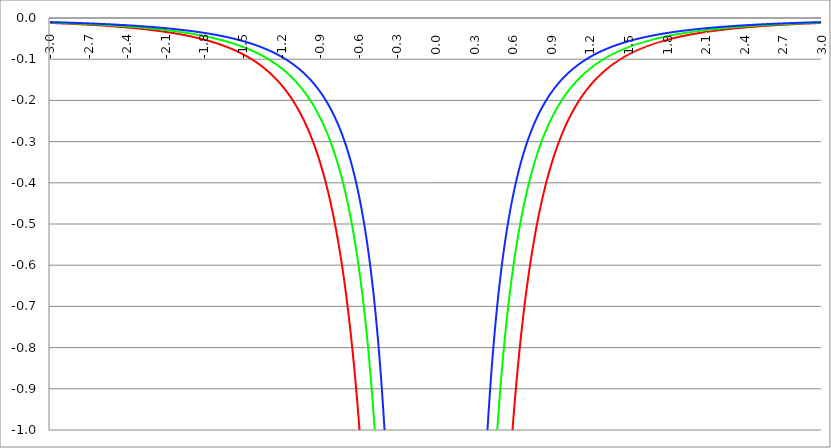
| Category | Series 1 | Series 0 | Series 2 |
|---|---|---|---|
| -3.0 | -0.012 | -0.011 | -0.01 |
| -2.997 | -0.012 | -0.011 | -0.01 |
| -2.994 | -0.012 | -0.011 | -0.01 |
| -2.991 | -0.012 | -0.011 | -0.01 |
| -2.988 | -0.012 | -0.011 | -0.01 |
| -2.984999999999999 | -0.012 | -0.011 | -0.01 |
| -2.981999999999999 | -0.012 | -0.011 | -0.01 |
| -2.978999999999999 | -0.012 | -0.011 | -0.01 |
| -2.975999999999999 | -0.012 | -0.011 | -0.01 |
| -2.972999999999999 | -0.012 | -0.011 | -0.01 |
| -2.969999999999999 | -0.012 | -0.011 | -0.01 |
| -2.966999999999999 | -0.012 | -0.011 | -0.01 |
| -2.963999999999999 | -0.012 | -0.011 | -0.01 |
| -2.960999999999998 | -0.012 | -0.011 | -0.01 |
| -2.957999999999998 | -0.012 | -0.011 | -0.01 |
| -2.954999999999998 | -0.012 | -0.011 | -0.01 |
| -2.951999999999998 | -0.013 | -0.012 | -0.01 |
| -2.948999999999998 | -0.013 | -0.012 | -0.01 |
| -2.945999999999998 | -0.013 | -0.012 | -0.01 |
| -2.942999999999998 | -0.013 | -0.012 | -0.01 |
| -2.939999999999998 | -0.013 | -0.012 | -0.01 |
| -2.936999999999998 | -0.013 | -0.012 | -0.01 |
| -2.933999999999997 | -0.013 | -0.012 | -0.01 |
| -2.930999999999997 | -0.013 | -0.012 | -0.01 |
| -2.927999999999997 | -0.013 | -0.012 | -0.011 |
| -2.924999999999997 | -0.013 | -0.012 | -0.011 |
| -2.921999999999997 | -0.013 | -0.012 | -0.011 |
| -2.918999999999997 | -0.013 | -0.012 | -0.011 |
| -2.915999999999997 | -0.013 | -0.012 | -0.011 |
| -2.912999999999997 | -0.013 | -0.012 | -0.011 |
| -2.909999999999997 | -0.013 | -0.012 | -0.011 |
| -2.906999999999996 | -0.013 | -0.012 | -0.011 |
| -2.903999999999996 | -0.013 | -0.012 | -0.011 |
| -2.900999999999996 | -0.013 | -0.012 | -0.011 |
| -2.897999999999996 | -0.013 | -0.012 | -0.011 |
| -2.894999999999996 | -0.013 | -0.012 | -0.011 |
| -2.891999999999996 | -0.013 | -0.012 | -0.011 |
| -2.888999999999996 | -0.013 | -0.012 | -0.011 |
| -2.885999999999996 | -0.013 | -0.012 | -0.011 |
| -2.882999999999996 | -0.013 | -0.012 | -0.011 |
| -2.879999999999995 | -0.013 | -0.012 | -0.011 |
| -2.876999999999995 | -0.014 | -0.012 | -0.011 |
| -2.873999999999995 | -0.014 | -0.012 | -0.011 |
| -2.870999999999995 | -0.014 | -0.012 | -0.011 |
| -2.867999999999995 | -0.014 | -0.012 | -0.011 |
| -2.864999999999995 | -0.014 | -0.013 | -0.011 |
| -2.861999999999995 | -0.014 | -0.013 | -0.011 |
| -2.858999999999995 | -0.014 | -0.013 | -0.011 |
| -2.855999999999994 | -0.014 | -0.013 | -0.011 |
| -2.852999999999994 | -0.014 | -0.013 | -0.011 |
| -2.849999999999994 | -0.014 | -0.013 | -0.011 |
| -2.846999999999994 | -0.014 | -0.013 | -0.011 |
| -2.843999999999994 | -0.014 | -0.013 | -0.011 |
| -2.840999999999994 | -0.014 | -0.013 | -0.011 |
| -2.837999999999994 | -0.014 | -0.013 | -0.011 |
| -2.834999999999994 | -0.014 | -0.013 | -0.011 |
| -2.831999999999994 | -0.014 | -0.013 | -0.011 |
| -2.828999999999993 | -0.014 | -0.013 | -0.012 |
| -2.825999999999993 | -0.014 | -0.013 | -0.012 |
| -2.822999999999993 | -0.014 | -0.013 | -0.012 |
| -2.819999999999993 | -0.014 | -0.013 | -0.012 |
| -2.816999999999993 | -0.014 | -0.013 | -0.012 |
| -2.813999999999993 | -0.014 | -0.013 | -0.012 |
| -2.810999999999993 | -0.014 | -0.013 | -0.012 |
| -2.807999999999993 | -0.015 | -0.013 | -0.012 |
| -2.804999999999993 | -0.015 | -0.013 | -0.012 |
| -2.801999999999992 | -0.015 | -0.013 | -0.012 |
| -2.798999999999992 | -0.015 | -0.013 | -0.012 |
| -2.795999999999992 | -0.015 | -0.013 | -0.012 |
| -2.792999999999992 | -0.015 | -0.013 | -0.012 |
| -2.789999999999992 | -0.015 | -0.013 | -0.012 |
| -2.786999999999992 | -0.015 | -0.014 | -0.012 |
| -2.783999999999992 | -0.015 | -0.014 | -0.012 |
| -2.780999999999992 | -0.015 | -0.014 | -0.012 |
| -2.777999999999992 | -0.015 | -0.014 | -0.012 |
| -2.774999999999991 | -0.015 | -0.014 | -0.012 |
| -2.771999999999991 | -0.015 | -0.014 | -0.012 |
| -2.768999999999991 | -0.015 | -0.014 | -0.012 |
| -2.765999999999991 | -0.015 | -0.014 | -0.012 |
| -2.762999999999991 | -0.015 | -0.014 | -0.012 |
| -2.759999999999991 | -0.015 | -0.014 | -0.012 |
| -2.756999999999991 | -0.015 | -0.014 | -0.012 |
| -2.753999999999991 | -0.015 | -0.014 | -0.012 |
| -2.75099999999999 | -0.015 | -0.014 | -0.012 |
| -2.74799999999999 | -0.015 | -0.014 | -0.012 |
| -2.74499999999999 | -0.016 | -0.014 | -0.012 |
| -2.74199999999999 | -0.016 | -0.014 | -0.013 |
| -2.73899999999999 | -0.016 | -0.014 | -0.013 |
| -2.73599999999999 | -0.016 | -0.014 | -0.013 |
| -2.73299999999999 | -0.016 | -0.014 | -0.013 |
| -2.72999999999999 | -0.016 | -0.014 | -0.013 |
| -2.72699999999999 | -0.016 | -0.014 | -0.013 |
| -2.723999999999989 | -0.016 | -0.014 | -0.013 |
| -2.720999999999989 | -0.016 | -0.014 | -0.013 |
| -2.717999999999989 | -0.016 | -0.014 | -0.013 |
| -2.714999999999989 | -0.016 | -0.015 | -0.013 |
| -2.711999999999989 | -0.016 | -0.015 | -0.013 |
| -2.708999999999989 | -0.016 | -0.015 | -0.013 |
| -2.705999999999989 | -0.016 | -0.015 | -0.013 |
| -2.702999999999989 | -0.016 | -0.015 | -0.013 |
| -2.699999999999989 | -0.016 | -0.015 | -0.013 |
| -2.696999999999988 | -0.016 | -0.015 | -0.013 |
| -2.693999999999988 | -0.016 | -0.015 | -0.013 |
| -2.690999999999988 | -0.016 | -0.015 | -0.013 |
| -2.687999999999988 | -0.016 | -0.015 | -0.013 |
| -2.684999999999988 | -0.017 | -0.015 | -0.013 |
| -2.681999999999988 | -0.017 | -0.015 | -0.013 |
| -2.678999999999988 | -0.017 | -0.015 | -0.013 |
| -2.675999999999988 | -0.017 | -0.015 | -0.013 |
| -2.672999999999988 | -0.017 | -0.015 | -0.013 |
| -2.669999999999987 | -0.017 | -0.015 | -0.013 |
| -2.666999999999987 | -0.017 | -0.015 | -0.013 |
| -2.663999999999987 | -0.017 | -0.015 | -0.013 |
| -2.660999999999987 | -0.017 | -0.015 | -0.014 |
| -2.657999999999987 | -0.017 | -0.015 | -0.014 |
| -2.654999999999987 | -0.017 | -0.015 | -0.014 |
| -2.651999999999987 | -0.017 | -0.016 | -0.014 |
| -2.648999999999987 | -0.017 | -0.016 | -0.014 |
| -2.645999999999986 | -0.017 | -0.016 | -0.014 |
| -2.642999999999986 | -0.017 | -0.016 | -0.014 |
| -2.639999999999986 | -0.017 | -0.016 | -0.014 |
| -2.636999999999986 | -0.017 | -0.016 | -0.014 |
| -2.633999999999986 | -0.018 | -0.016 | -0.014 |
| -2.630999999999986 | -0.018 | -0.016 | -0.014 |
| -2.627999999999986 | -0.018 | -0.016 | -0.014 |
| -2.624999999999986 | -0.018 | -0.016 | -0.014 |
| -2.621999999999986 | -0.018 | -0.016 | -0.014 |
| -2.618999999999985 | -0.018 | -0.016 | -0.014 |
| -2.615999999999985 | -0.018 | -0.016 | -0.014 |
| -2.612999999999985 | -0.018 | -0.016 | -0.014 |
| -2.609999999999985 | -0.018 | -0.016 | -0.014 |
| -2.606999999999985 | -0.018 | -0.016 | -0.014 |
| -2.603999999999985 | -0.018 | -0.016 | -0.014 |
| -2.600999999999985 | -0.018 | -0.016 | -0.014 |
| -2.597999999999985 | -0.018 | -0.016 | -0.014 |
| -2.594999999999985 | -0.018 | -0.016 | -0.014 |
| -2.591999999999985 | -0.018 | -0.017 | -0.014 |
| -2.588999999999984 | -0.018 | -0.017 | -0.015 |
| -2.585999999999984 | -0.018 | -0.017 | -0.015 |
| -2.582999999999984 | -0.019 | -0.017 | -0.015 |
| -2.579999999999984 | -0.019 | -0.017 | -0.015 |
| -2.576999999999984 | -0.019 | -0.017 | -0.015 |
| -2.573999999999984 | -0.019 | -0.017 | -0.015 |
| -2.570999999999984 | -0.019 | -0.017 | -0.015 |
| -2.567999999999984 | -0.019 | -0.017 | -0.015 |
| -2.564999999999984 | -0.019 | -0.017 | -0.015 |
| -2.561999999999983 | -0.019 | -0.017 | -0.015 |
| -2.558999999999983 | -0.019 | -0.017 | -0.015 |
| -2.555999999999983 | -0.019 | -0.017 | -0.015 |
| -2.552999999999983 | -0.019 | -0.017 | -0.015 |
| -2.549999999999983 | -0.019 | -0.017 | -0.015 |
| -2.546999999999983 | -0.019 | -0.017 | -0.015 |
| -2.543999999999983 | -0.019 | -0.017 | -0.015 |
| -2.540999999999983 | -0.019 | -0.017 | -0.015 |
| -2.537999999999982 | -0.02 | -0.018 | -0.015 |
| -2.534999999999982 | -0.02 | -0.018 | -0.015 |
| -2.531999999999982 | -0.02 | -0.018 | -0.015 |
| -2.528999999999982 | -0.02 | -0.018 | -0.015 |
| -2.525999999999982 | -0.02 | -0.018 | -0.015 |
| -2.522999999999982 | -0.02 | -0.018 | -0.016 |
| -2.519999999999982 | -0.02 | -0.018 | -0.016 |
| -2.516999999999982 | -0.02 | -0.018 | -0.016 |
| -2.513999999999982 | -0.02 | -0.018 | -0.016 |
| -2.510999999999981 | -0.02 | -0.018 | -0.016 |
| -2.507999999999981 | -0.02 | -0.018 | -0.016 |
| -2.504999999999981 | -0.02 | -0.018 | -0.016 |
| -2.501999999999981 | -0.02 | -0.018 | -0.016 |
| -2.498999999999981 | -0.02 | -0.018 | -0.016 |
| -2.495999999999981 | -0.02 | -0.018 | -0.016 |
| -2.492999999999981 | -0.021 | -0.018 | -0.016 |
| -2.489999999999981 | -0.021 | -0.018 | -0.016 |
| -2.486999999999981 | -0.021 | -0.019 | -0.016 |
| -2.48399999999998 | -0.021 | -0.019 | -0.016 |
| -2.48099999999998 | -0.021 | -0.019 | -0.016 |
| -2.47799999999998 | -0.021 | -0.019 | -0.016 |
| -2.47499999999998 | -0.021 | -0.019 | -0.016 |
| -2.47199999999998 | -0.021 | -0.019 | -0.016 |
| -2.46899999999998 | -0.021 | -0.019 | -0.016 |
| -2.46599999999998 | -0.021 | -0.019 | -0.016 |
| -2.46299999999998 | -0.021 | -0.019 | -0.017 |
| -2.45999999999998 | -0.021 | -0.019 | -0.017 |
| -2.456999999999979 | -0.021 | -0.019 | -0.017 |
| -2.453999999999979 | -0.022 | -0.019 | -0.017 |
| -2.450999999999979 | -0.022 | -0.019 | -0.017 |
| -2.44799999999998 | -0.022 | -0.019 | -0.017 |
| -2.444999999999979 | -0.022 | -0.019 | -0.017 |
| -2.441999999999979 | -0.022 | -0.019 | -0.017 |
| -2.438999999999979 | -0.022 | -0.02 | -0.017 |
| -2.435999999999979 | -0.022 | -0.02 | -0.017 |
| -2.432999999999978 | -0.022 | -0.02 | -0.017 |
| -2.429999999999978 | -0.022 | -0.02 | -0.017 |
| -2.426999999999978 | -0.022 | -0.02 | -0.017 |
| -2.423999999999978 | -0.022 | -0.02 | -0.017 |
| -2.420999999999978 | -0.022 | -0.02 | -0.017 |
| -2.417999999999978 | -0.022 | -0.02 | -0.017 |
| -2.414999999999978 | -0.023 | -0.02 | -0.017 |
| -2.411999999999978 | -0.023 | -0.02 | -0.017 |
| -2.408999999999978 | -0.023 | -0.02 | -0.017 |
| -2.405999999999977 | -0.023 | -0.02 | -0.018 |
| -2.402999999999977 | -0.023 | -0.02 | -0.018 |
| -2.399999999999977 | -0.023 | -0.02 | -0.018 |
| -2.396999999999977 | -0.023 | -0.02 | -0.018 |
| -2.393999999999977 | -0.023 | -0.021 | -0.018 |
| -2.390999999999977 | -0.023 | -0.021 | -0.018 |
| -2.387999999999977 | -0.023 | -0.021 | -0.018 |
| -2.384999999999977 | -0.023 | -0.021 | -0.018 |
| -2.381999999999977 | -0.023 | -0.021 | -0.018 |
| -2.378999999999976 | -0.024 | -0.021 | -0.018 |
| -2.375999999999976 | -0.024 | -0.021 | -0.018 |
| -2.372999999999976 | -0.024 | -0.021 | -0.018 |
| -2.369999999999976 | -0.024 | -0.021 | -0.018 |
| -2.366999999999976 | -0.024 | -0.021 | -0.018 |
| -2.363999999999976 | -0.024 | -0.021 | -0.018 |
| -2.360999999999976 | -0.024 | -0.021 | -0.018 |
| -2.357999999999976 | -0.024 | -0.021 | -0.018 |
| -2.354999999999976 | -0.024 | -0.021 | -0.019 |
| -2.351999999999975 | -0.024 | -0.022 | -0.019 |
| -2.348999999999975 | -0.024 | -0.022 | -0.019 |
| -2.345999999999975 | -0.025 | -0.022 | -0.019 |
| -2.342999999999975 | -0.025 | -0.022 | -0.019 |
| -2.339999999999975 | -0.025 | -0.022 | -0.019 |
| -2.336999999999975 | -0.025 | -0.022 | -0.019 |
| -2.333999999999975 | -0.025 | -0.022 | -0.019 |
| -2.330999999999975 | -0.025 | -0.022 | -0.019 |
| -2.327999999999974 | -0.025 | -0.022 | -0.019 |
| -2.324999999999974 | -0.025 | -0.022 | -0.019 |
| -2.321999999999974 | -0.025 | -0.022 | -0.019 |
| -2.318999999999974 | -0.025 | -0.022 | -0.019 |
| -2.315999999999974 | -0.025 | -0.022 | -0.019 |
| -2.312999999999974 | -0.026 | -0.023 | -0.019 |
| -2.309999999999974 | -0.026 | -0.023 | -0.019 |
| -2.306999999999974 | -0.026 | -0.023 | -0.02 |
| -2.303999999999974 | -0.026 | -0.023 | -0.02 |
| -2.300999999999973 | -0.026 | -0.023 | -0.02 |
| -2.297999999999973 | -0.026 | -0.023 | -0.02 |
| -2.294999999999973 | -0.026 | -0.023 | -0.02 |
| -2.291999999999973 | -0.026 | -0.023 | -0.02 |
| -2.288999999999973 | -0.026 | -0.023 | -0.02 |
| -2.285999999999973 | -0.026 | -0.023 | -0.02 |
| -2.282999999999973 | -0.027 | -0.023 | -0.02 |
| -2.279999999999973 | -0.027 | -0.023 | -0.02 |
| -2.276999999999973 | -0.027 | -0.024 | -0.02 |
| -2.273999999999972 | -0.027 | -0.024 | -0.02 |
| -2.270999999999972 | -0.027 | -0.024 | -0.02 |
| -2.267999999999972 | -0.027 | -0.024 | -0.02 |
| -2.264999999999972 | -0.027 | -0.024 | -0.02 |
| -2.261999999999972 | -0.027 | -0.024 | -0.021 |
| -2.258999999999972 | -0.027 | -0.024 | -0.021 |
| -2.255999999999972 | -0.027 | -0.024 | -0.021 |
| -2.252999999999972 | -0.028 | -0.024 | -0.021 |
| -2.249999999999972 | -0.028 | -0.024 | -0.021 |
| -2.246999999999971 | -0.028 | -0.024 | -0.021 |
| -2.243999999999971 | -0.028 | -0.024 | -0.021 |
| -2.240999999999971 | -0.028 | -0.025 | -0.021 |
| -2.237999999999971 | -0.028 | -0.025 | -0.021 |
| -2.234999999999971 | -0.028 | -0.025 | -0.021 |
| -2.231999999999971 | -0.028 | -0.025 | -0.021 |
| -2.228999999999971 | -0.028 | -0.025 | -0.021 |
| -2.225999999999971 | -0.029 | -0.025 | -0.021 |
| -2.222999999999971 | -0.029 | -0.025 | -0.021 |
| -2.21999999999997 | -0.029 | -0.025 | -0.022 |
| -2.21699999999997 | -0.029 | -0.025 | -0.022 |
| -2.21399999999997 | -0.029 | -0.025 | -0.022 |
| -2.21099999999997 | -0.029 | -0.025 | -0.022 |
| -2.20799999999997 | -0.029 | -0.026 | -0.022 |
| -2.20499999999997 | -0.029 | -0.026 | -0.022 |
| -2.20199999999997 | -0.029 | -0.026 | -0.022 |
| -2.19899999999997 | -0.03 | -0.026 | -0.022 |
| -2.19599999999997 | -0.03 | -0.026 | -0.022 |
| -2.192999999999969 | -0.03 | -0.026 | -0.022 |
| -2.189999999999969 | -0.03 | -0.026 | -0.022 |
| -2.186999999999969 | -0.03 | -0.026 | -0.022 |
| -2.18399999999997 | -0.03 | -0.026 | -0.022 |
| -2.180999999999969 | -0.03 | -0.026 | -0.023 |
| -2.177999999999969 | -0.03 | -0.027 | -0.023 |
| -2.174999999999969 | -0.031 | -0.027 | -0.023 |
| -2.171999999999969 | -0.031 | -0.027 | -0.023 |
| -2.168999999999968 | -0.031 | -0.027 | -0.023 |
| -2.165999999999968 | -0.031 | -0.027 | -0.023 |
| -2.162999999999968 | -0.031 | -0.027 | -0.023 |
| -2.159999999999968 | -0.031 | -0.027 | -0.023 |
| -2.156999999999968 | -0.031 | -0.027 | -0.023 |
| -2.153999999999968 | -0.031 | -0.027 | -0.023 |
| -2.150999999999968 | -0.032 | -0.027 | -0.023 |
| -2.147999999999968 | -0.032 | -0.028 | -0.023 |
| -2.144999999999968 | -0.032 | -0.028 | -0.023 |
| -2.141999999999967 | -0.032 | -0.028 | -0.024 |
| -2.138999999999967 | -0.032 | -0.028 | -0.024 |
| -2.135999999999967 | -0.032 | -0.028 | -0.024 |
| -2.132999999999967 | -0.032 | -0.028 | -0.024 |
| -2.129999999999967 | -0.032 | -0.028 | -0.024 |
| -2.126999999999967 | -0.033 | -0.028 | -0.024 |
| -2.123999999999967 | -0.033 | -0.028 | -0.024 |
| -2.120999999999967 | -0.033 | -0.028 | -0.024 |
| -2.117999999999967 | -0.033 | -0.029 | -0.024 |
| -2.114999999999966 | -0.033 | -0.029 | -0.024 |
| -2.111999999999966 | -0.033 | -0.029 | -0.024 |
| -2.108999999999966 | -0.033 | -0.029 | -0.024 |
| -2.105999999999966 | -0.034 | -0.029 | -0.025 |
| -2.102999999999966 | -0.034 | -0.029 | -0.025 |
| -2.099999999999966 | -0.034 | -0.029 | -0.025 |
| -2.096999999999966 | -0.034 | -0.029 | -0.025 |
| -2.093999999999966 | -0.034 | -0.029 | -0.025 |
| -2.090999999999966 | -0.034 | -0.03 | -0.025 |
| -2.087999999999965 | -0.034 | -0.03 | -0.025 |
| -2.084999999999965 | -0.035 | -0.03 | -0.025 |
| -2.081999999999965 | -0.035 | -0.03 | -0.025 |
| -2.078999999999965 | -0.035 | -0.03 | -0.025 |
| -2.075999999999965 | -0.035 | -0.03 | -0.025 |
| -2.072999999999965 | -0.035 | -0.03 | -0.026 |
| -2.069999999999965 | -0.035 | -0.03 | -0.026 |
| -2.066999999999965 | -0.035 | -0.031 | -0.026 |
| -2.063999999999965 | -0.036 | -0.031 | -0.026 |
| -2.060999999999964 | -0.036 | -0.031 | -0.026 |
| -2.057999999999964 | -0.036 | -0.031 | -0.026 |
| -2.054999999999964 | -0.036 | -0.031 | -0.026 |
| -2.051999999999964 | -0.036 | -0.031 | -0.026 |
| -2.048999999999964 | -0.036 | -0.031 | -0.026 |
| -2.045999999999964 | -0.036 | -0.031 | -0.026 |
| -2.042999999999964 | -0.037 | -0.031 | -0.027 |
| -2.039999999999964 | -0.037 | -0.032 | -0.027 |
| -2.036999999999963 | -0.037 | -0.032 | -0.027 |
| -2.033999999999963 | -0.037 | -0.032 | -0.027 |
| -2.030999999999963 | -0.037 | -0.032 | -0.027 |
| -2.027999999999963 | -0.037 | -0.032 | -0.027 |
| -2.024999999999963 | -0.038 | -0.032 | -0.027 |
| -2.021999999999963 | -0.038 | -0.032 | -0.027 |
| -2.018999999999963 | -0.038 | -0.032 | -0.027 |
| -2.015999999999963 | -0.038 | -0.033 | -0.027 |
| -2.012999999999963 | -0.038 | -0.033 | -0.028 |
| -2.009999999999962 | -0.038 | -0.033 | -0.028 |
| -2.006999999999962 | -0.039 | -0.033 | -0.028 |
| -2.003999999999962 | -0.039 | -0.033 | -0.028 |
| -2.000999999999962 | -0.039 | -0.033 | -0.028 |
| -1.997999999999962 | -0.039 | -0.033 | -0.028 |
| -1.994999999999962 | -0.039 | -0.034 | -0.028 |
| -1.991999999999962 | -0.039 | -0.034 | -0.028 |
| -1.988999999999963 | -0.04 | -0.034 | -0.028 |
| -1.985999999999963 | -0.04 | -0.034 | -0.028 |
| -1.982999999999963 | -0.04 | -0.034 | -0.029 |
| -1.979999999999963 | -0.04 | -0.034 | -0.029 |
| -1.976999999999963 | -0.04 | -0.034 | -0.029 |
| -1.973999999999963 | -0.04 | -0.034 | -0.029 |
| -1.970999999999963 | -0.041 | -0.035 | -0.029 |
| -1.967999999999963 | -0.041 | -0.035 | -0.029 |
| -1.964999999999963 | -0.041 | -0.035 | -0.029 |
| -1.961999999999964 | -0.041 | -0.035 | -0.029 |
| -1.958999999999964 | -0.041 | -0.035 | -0.029 |
| -1.955999999999964 | -0.041 | -0.035 | -0.03 |
| -1.952999999999964 | -0.042 | -0.035 | -0.03 |
| -1.949999999999964 | -0.042 | -0.036 | -0.03 |
| -1.946999999999964 | -0.042 | -0.036 | -0.03 |
| -1.943999999999964 | -0.042 | -0.036 | -0.03 |
| -1.940999999999964 | -0.042 | -0.036 | -0.03 |
| -1.937999999999964 | -0.043 | -0.036 | -0.03 |
| -1.934999999999964 | -0.043 | -0.036 | -0.03 |
| -1.931999999999965 | -0.043 | -0.036 | -0.03 |
| -1.928999999999965 | -0.043 | -0.037 | -0.031 |
| -1.925999999999965 | -0.043 | -0.037 | -0.031 |
| -1.922999999999965 | -0.044 | -0.037 | -0.031 |
| -1.919999999999965 | -0.044 | -0.037 | -0.031 |
| -1.916999999999965 | -0.044 | -0.037 | -0.031 |
| -1.913999999999965 | -0.044 | -0.037 | -0.031 |
| -1.910999999999965 | -0.044 | -0.038 | -0.031 |
| -1.907999999999965 | -0.045 | -0.038 | -0.031 |
| -1.904999999999966 | -0.045 | -0.038 | -0.032 |
| -1.901999999999966 | -0.045 | -0.038 | -0.032 |
| -1.898999999999966 | -0.045 | -0.038 | -0.032 |
| -1.895999999999966 | -0.045 | -0.038 | -0.032 |
| -1.892999999999966 | -0.046 | -0.039 | -0.032 |
| -1.889999999999966 | -0.046 | -0.039 | -0.032 |
| -1.886999999999966 | -0.046 | -0.039 | -0.032 |
| -1.883999999999966 | -0.046 | -0.039 | -0.032 |
| -1.880999999999966 | -0.046 | -0.039 | -0.033 |
| -1.877999999999967 | -0.047 | -0.039 | -0.033 |
| -1.874999999999967 | -0.047 | -0.039 | -0.033 |
| -1.871999999999967 | -0.047 | -0.04 | -0.033 |
| -1.868999999999967 | -0.047 | -0.04 | -0.033 |
| -1.865999999999967 | -0.047 | -0.04 | -0.033 |
| -1.862999999999967 | -0.048 | -0.04 | -0.033 |
| -1.859999999999967 | -0.048 | -0.04 | -0.033 |
| -1.856999999999967 | -0.048 | -0.041 | -0.034 |
| -1.853999999999967 | -0.048 | -0.041 | -0.034 |
| -1.850999999999968 | -0.049 | -0.041 | -0.034 |
| -1.847999999999968 | -0.049 | -0.041 | -0.034 |
| -1.844999999999968 | -0.049 | -0.041 | -0.034 |
| -1.841999999999968 | -0.049 | -0.041 | -0.034 |
| -1.838999999999968 | -0.049 | -0.042 | -0.034 |
| -1.835999999999968 | -0.05 | -0.042 | -0.035 |
| -1.832999999999968 | -0.05 | -0.042 | -0.035 |
| -1.829999999999968 | -0.05 | -0.042 | -0.035 |
| -1.826999999999968 | -0.05 | -0.042 | -0.035 |
| -1.823999999999968 | -0.051 | -0.042 | -0.035 |
| -1.820999999999969 | -0.051 | -0.043 | -0.035 |
| -1.817999999999969 | -0.051 | -0.043 | -0.035 |
| -1.814999999999969 | -0.051 | -0.043 | -0.035 |
| -1.811999999999969 | -0.052 | -0.043 | -0.036 |
| -1.808999999999969 | -0.052 | -0.043 | -0.036 |
| -1.805999999999969 | -0.052 | -0.044 | -0.036 |
| -1.802999999999969 | -0.052 | -0.044 | -0.036 |
| -1.799999999999969 | -0.053 | -0.044 | -0.036 |
| -1.796999999999969 | -0.053 | -0.044 | -0.036 |
| -1.79399999999997 | -0.053 | -0.044 | -0.037 |
| -1.79099999999997 | -0.053 | -0.045 | -0.037 |
| -1.78799999999997 | -0.054 | -0.045 | -0.037 |
| -1.78499999999997 | -0.054 | -0.045 | -0.037 |
| -1.78199999999997 | -0.054 | -0.045 | -0.037 |
| -1.77899999999997 | -0.054 | -0.045 | -0.037 |
| -1.77599999999997 | -0.055 | -0.046 | -0.037 |
| -1.77299999999997 | -0.055 | -0.046 | -0.038 |
| -1.76999999999997 | -0.055 | -0.046 | -0.038 |
| -1.766999999999971 | -0.055 | -0.046 | -0.038 |
| -1.763999999999971 | -0.056 | -0.046 | -0.038 |
| -1.760999999999971 | -0.056 | -0.047 | -0.038 |
| -1.757999999999971 | -0.056 | -0.047 | -0.038 |
| -1.754999999999971 | -0.057 | -0.047 | -0.039 |
| -1.751999999999971 | -0.057 | -0.047 | -0.039 |
| -1.748999999999971 | -0.057 | -0.047 | -0.039 |
| -1.745999999999971 | -0.057 | -0.048 | -0.039 |
| -1.742999999999971 | -0.058 | -0.048 | -0.039 |
| -1.739999999999971 | -0.058 | -0.048 | -0.039 |
| -1.736999999999972 | -0.058 | -0.048 | -0.039 |
| -1.733999999999972 | -0.058 | -0.048 | -0.04 |
| -1.730999999999972 | -0.059 | -0.049 | -0.04 |
| -1.727999999999972 | -0.059 | -0.049 | -0.04 |
| -1.724999999999972 | -0.059 | -0.049 | -0.04 |
| -1.721999999999972 | -0.06 | -0.049 | -0.04 |
| -1.718999999999972 | -0.06 | -0.05 | -0.04 |
| -1.715999999999972 | -0.06 | -0.05 | -0.041 |
| -1.712999999999972 | -0.061 | -0.05 | -0.041 |
| -1.709999999999973 | -0.061 | -0.05 | -0.041 |
| -1.706999999999973 | -0.061 | -0.05 | -0.041 |
| -1.703999999999973 | -0.061 | -0.051 | -0.041 |
| -1.700999999999973 | -0.062 | -0.051 | -0.042 |
| -1.697999999999973 | -0.062 | -0.051 | -0.042 |
| -1.694999999999973 | -0.062 | -0.051 | -0.042 |
| -1.691999999999973 | -0.063 | -0.052 | -0.042 |
| -1.688999999999973 | -0.063 | -0.052 | -0.042 |
| -1.685999999999973 | -0.063 | -0.052 | -0.042 |
| -1.682999999999974 | -0.064 | -0.052 | -0.043 |
| -1.679999999999974 | -0.064 | -0.053 | -0.043 |
| -1.676999999999974 | -0.064 | -0.053 | -0.043 |
| -1.673999999999974 | -0.065 | -0.053 | -0.043 |
| -1.670999999999974 | -0.065 | -0.053 | -0.043 |
| -1.667999999999974 | -0.065 | -0.054 | -0.044 |
| -1.664999999999974 | -0.066 | -0.054 | -0.044 |
| -1.661999999999974 | -0.066 | -0.054 | -0.044 |
| -1.658999999999974 | -0.066 | -0.054 | -0.044 |
| -1.655999999999975 | -0.067 | -0.055 | -0.044 |
| -1.652999999999975 | -0.067 | -0.055 | -0.045 |
| -1.649999999999975 | -0.067 | -0.055 | -0.045 |
| -1.646999999999975 | -0.068 | -0.055 | -0.045 |
| -1.643999999999975 | -0.068 | -0.056 | -0.045 |
| -1.640999999999975 | -0.068 | -0.056 | -0.045 |
| -1.637999999999975 | -0.069 | -0.056 | -0.045 |
| -1.634999999999975 | -0.069 | -0.056 | -0.046 |
| -1.631999999999975 | -0.069 | -0.057 | -0.046 |
| -1.628999999999975 | -0.07 | -0.057 | -0.046 |
| -1.625999999999976 | -0.07 | -0.057 | -0.046 |
| -1.622999999999976 | -0.071 | -0.057 | -0.046 |
| -1.619999999999976 | -0.071 | -0.058 | -0.047 |
| -1.616999999999976 | -0.071 | -0.058 | -0.047 |
| -1.613999999999976 | -0.072 | -0.058 | -0.047 |
| -1.610999999999976 | -0.072 | -0.059 | -0.047 |
| -1.607999999999976 | -0.072 | -0.059 | -0.048 |
| -1.604999999999976 | -0.073 | -0.059 | -0.048 |
| -1.601999999999976 | -0.073 | -0.059 | -0.048 |
| -1.598999999999977 | -0.074 | -0.06 | -0.048 |
| -1.595999999999977 | -0.074 | -0.06 | -0.048 |
| -1.592999999999977 | -0.074 | -0.06 | -0.049 |
| -1.589999999999977 | -0.075 | -0.061 | -0.049 |
| -1.586999999999977 | -0.075 | -0.061 | -0.049 |
| -1.583999999999977 | -0.076 | -0.061 | -0.049 |
| -1.580999999999977 | -0.076 | -0.061 | -0.05 |
| -1.577999999999977 | -0.076 | -0.062 | -0.05 |
| -1.574999999999978 | -0.077 | -0.062 | -0.05 |
| -1.571999999999978 | -0.077 | -0.062 | -0.05 |
| -1.568999999999978 | -0.078 | -0.063 | -0.05 |
| -1.565999999999978 | -0.078 | -0.063 | -0.051 |
| -1.562999999999978 | -0.078 | -0.063 | -0.051 |
| -1.559999999999978 | -0.079 | -0.064 | -0.051 |
| -1.556999999999978 | -0.079 | -0.064 | -0.051 |
| -1.553999999999978 | -0.08 | -0.064 | -0.052 |
| -1.550999999999978 | -0.08 | -0.065 | -0.052 |
| -1.547999999999978 | -0.081 | -0.065 | -0.052 |
| -1.544999999999979 | -0.081 | -0.065 | -0.052 |
| -1.541999999999979 | -0.081 | -0.065 | -0.053 |
| -1.538999999999979 | -0.082 | -0.066 | -0.053 |
| -1.535999999999979 | -0.082 | -0.066 | -0.053 |
| -1.532999999999979 | -0.083 | -0.066 | -0.053 |
| -1.529999999999979 | -0.083 | -0.067 | -0.054 |
| -1.526999999999979 | -0.084 | -0.067 | -0.054 |
| -1.523999999999979 | -0.084 | -0.067 | -0.054 |
| -1.520999999999979 | -0.085 | -0.068 | -0.054 |
| -1.51799999999998 | -0.085 | -0.068 | -0.055 |
| -1.51499999999998 | -0.086 | -0.068 | -0.055 |
| -1.51199999999998 | -0.086 | -0.069 | -0.055 |
| -1.50899999999998 | -0.087 | -0.069 | -0.055 |
| -1.50599999999998 | -0.087 | -0.07 | -0.056 |
| -1.50299999999998 | -0.088 | -0.07 | -0.056 |
| -1.49999999999998 | -0.088 | -0.07 | -0.056 |
| -1.49699999999998 | -0.089 | -0.071 | -0.056 |
| -1.49399999999998 | -0.089 | -0.071 | -0.057 |
| -1.490999999999981 | -0.09 | -0.071 | -0.057 |
| -1.487999999999981 | -0.09 | -0.072 | -0.057 |
| -1.484999999999981 | -0.091 | -0.072 | -0.057 |
| -1.481999999999981 | -0.091 | -0.072 | -0.058 |
| -1.478999999999981 | -0.092 | -0.073 | -0.058 |
| -1.475999999999981 | -0.092 | -0.073 | -0.058 |
| -1.472999999999981 | -0.093 | -0.074 | -0.059 |
| -1.469999999999981 | -0.093 | -0.074 | -0.059 |
| -1.466999999999981 | -0.094 | -0.074 | -0.059 |
| -1.463999999999982 | -0.094 | -0.075 | -0.059 |
| -1.460999999999982 | -0.095 | -0.075 | -0.06 |
| -1.457999999999982 | -0.095 | -0.075 | -0.06 |
| -1.454999999999982 | -0.096 | -0.076 | -0.06 |
| -1.451999999999982 | -0.096 | -0.076 | -0.061 |
| -1.448999999999982 | -0.097 | -0.077 | -0.061 |
| -1.445999999999982 | -0.098 | -0.077 | -0.061 |
| -1.442999999999982 | -0.098 | -0.077 | -0.061 |
| -1.439999999999982 | -0.099 | -0.078 | -0.062 |
| -1.436999999999982 | -0.099 | -0.078 | -0.062 |
| -1.433999999999983 | -0.1 | -0.079 | -0.062 |
| -1.430999999999983 | -0.1 | -0.079 | -0.063 |
| -1.427999999999983 | -0.101 | -0.079 | -0.063 |
| -1.424999999999983 | -0.102 | -0.08 | -0.063 |
| -1.421999999999983 | -0.102 | -0.08 | -0.064 |
| -1.418999999999983 | -0.103 | -0.081 | -0.064 |
| -1.415999999999983 | -0.103 | -0.081 | -0.064 |
| -1.412999999999983 | -0.104 | -0.082 | -0.065 |
| -1.409999999999983 | -0.105 | -0.082 | -0.065 |
| -1.406999999999984 | -0.105 | -0.083 | -0.065 |
| -1.403999999999984 | -0.106 | -0.083 | -0.066 |
| -1.400999999999984 | -0.107 | -0.083 | -0.066 |
| -1.397999999999984 | -0.107 | -0.084 | -0.066 |
| -1.394999999999984 | -0.108 | -0.084 | -0.067 |
| -1.391999999999984 | -0.108 | -0.085 | -0.067 |
| -1.388999999999984 | -0.109 | -0.085 | -0.067 |
| -1.385999999999984 | -0.11 | -0.086 | -0.068 |
| -1.382999999999984 | -0.11 | -0.086 | -0.068 |
| -1.379999999999985 | -0.111 | -0.087 | -0.068 |
| -1.376999999999985 | -0.112 | -0.087 | -0.069 |
| -1.373999999999985 | -0.112 | -0.088 | -0.069 |
| -1.370999999999985 | -0.113 | -0.088 | -0.069 |
| -1.367999999999985 | -0.114 | -0.089 | -0.07 |
| -1.364999999999985 | -0.114 | -0.089 | -0.07 |
| -1.361999999999985 | -0.115 | -0.089 | -0.07 |
| -1.358999999999985 | -0.116 | -0.09 | -0.071 |
| -1.355999999999985 | -0.117 | -0.09 | -0.071 |
| -1.352999999999985 | -0.117 | -0.091 | -0.071 |
| -1.349999999999986 | -0.118 | -0.091 | -0.072 |
| -1.346999999999986 | -0.119 | -0.092 | -0.072 |
| -1.343999999999986 | -0.12 | -0.092 | -0.073 |
| -1.340999999999986 | -0.12 | -0.093 | -0.073 |
| -1.337999999999986 | -0.121 | -0.094 | -0.073 |
| -1.334999999999986 | -0.122 | -0.094 | -0.074 |
| -1.331999999999986 | -0.123 | -0.095 | -0.074 |
| -1.328999999999986 | -0.123 | -0.095 | -0.074 |
| -1.325999999999986 | -0.124 | -0.096 | -0.075 |
| -1.322999999999987 | -0.125 | -0.096 | -0.075 |
| -1.319999999999987 | -0.126 | -0.097 | -0.076 |
| -1.316999999999987 | -0.126 | -0.097 | -0.076 |
| -1.313999999999987 | -0.127 | -0.098 | -0.076 |
| -1.310999999999987 | -0.128 | -0.098 | -0.077 |
| -1.307999999999987 | -0.129 | -0.099 | -0.077 |
| -1.304999999999987 | -0.13 | -0.099 | -0.078 |
| -1.301999999999987 | -0.13 | -0.1 | -0.078 |
| -1.298999999999987 | -0.131 | -0.101 | -0.078 |
| -1.295999999999988 | -0.132 | -0.101 | -0.079 |
| -1.292999999999988 | -0.133 | -0.102 | -0.079 |
| -1.289999999999988 | -0.134 | -0.102 | -0.08 |
| -1.286999999999988 | -0.135 | -0.103 | -0.08 |
| -1.283999999999988 | -0.136 | -0.104 | -0.081 |
| -1.280999999999988 | -0.136 | -0.104 | -0.081 |
| -1.277999999999988 | -0.137 | -0.105 | -0.081 |
| -1.274999999999988 | -0.138 | -0.105 | -0.082 |
| -1.271999999999988 | -0.139 | -0.106 | -0.082 |
| -1.268999999999989 | -0.14 | -0.107 | -0.083 |
| -1.265999999999989 | -0.141 | -0.107 | -0.083 |
| -1.262999999999989 | -0.142 | -0.108 | -0.084 |
| -1.259999999999989 | -0.143 | -0.108 | -0.084 |
| -1.256999999999989 | -0.144 | -0.109 | -0.085 |
| -1.253999999999989 | -0.145 | -0.11 | -0.085 |
| -1.250999999999989 | -0.146 | -0.11 | -0.086 |
| -1.247999999999989 | -0.147 | -0.111 | -0.086 |
| -1.244999999999989 | -0.148 | -0.112 | -0.087 |
| -1.24199999999999 | -0.149 | -0.112 | -0.087 |
| -1.23899999999999 | -0.149 | -0.113 | -0.088 |
| -1.23599999999999 | -0.15 | -0.114 | -0.088 |
| -1.23299999999999 | -0.151 | -0.114 | -0.088 |
| -1.22999999999999 | -0.153 | -0.115 | -0.089 |
| -1.22699999999999 | -0.154 | -0.116 | -0.089 |
| -1.22399999999999 | -0.155 | -0.116 | -0.09 |
| -1.22099999999999 | -0.156 | -0.117 | -0.09 |
| -1.21799999999999 | -0.157 | -0.118 | -0.091 |
| -1.214999999999991 | -0.158 | -0.119 | -0.092 |
| -1.211999999999991 | -0.159 | -0.119 | -0.092 |
| -1.208999999999991 | -0.16 | -0.12 | -0.093 |
| -1.205999999999991 | -0.161 | -0.121 | -0.093 |
| -1.202999999999991 | -0.162 | -0.121 | -0.094 |
| -1.199999999999991 | -0.163 | -0.122 | -0.094 |
| -1.196999999999991 | -0.164 | -0.123 | -0.095 |
| -1.193999999999991 | -0.165 | -0.124 | -0.095 |
| -1.190999999999991 | -0.167 | -0.124 | -0.096 |
| -1.187999999999991 | -0.168 | -0.125 | -0.096 |
| -1.184999999999992 | -0.169 | -0.126 | -0.097 |
| -1.181999999999992 | -0.17 | -0.127 | -0.097 |
| -1.178999999999992 | -0.171 | -0.128 | -0.098 |
| -1.175999999999992 | -0.172 | -0.128 | -0.099 |
| -1.172999999999992 | -0.174 | -0.129 | -0.099 |
| -1.169999999999992 | -0.175 | -0.13 | -0.1 |
| -1.166999999999992 | -0.176 | -0.131 | -0.1 |
| -1.163999999999992 | -0.177 | -0.132 | -0.101 |
| -1.160999999999992 | -0.178 | -0.132 | -0.102 |
| -1.157999999999993 | -0.18 | -0.133 | -0.102 |
| -1.154999999999993 | -0.181 | -0.134 | -0.103 |
| -1.151999999999993 | -0.182 | -0.135 | -0.103 |
| -1.148999999999993 | -0.184 | -0.136 | -0.104 |
| -1.145999999999993 | -0.185 | -0.137 | -0.105 |
| -1.142999999999993 | -0.186 | -0.138 | -0.105 |
| -1.139999999999993 | -0.188 | -0.138 | -0.106 |
| -1.136999999999993 | -0.189 | -0.139 | -0.106 |
| -1.133999999999993 | -0.19 | -0.14 | -0.107 |
| -1.130999999999994 | -0.192 | -0.141 | -0.108 |
| -1.127999999999994 | -0.193 | -0.142 | -0.108 |
| -1.124999999999994 | -0.194 | -0.143 | -0.109 |
| -1.121999999999994 | -0.196 | -0.144 | -0.11 |
| -1.118999999999994 | -0.197 | -0.145 | -0.11 |
| -1.115999999999994 | -0.199 | -0.146 | -0.111 |
| -1.112999999999994 | -0.2 | -0.147 | -0.112 |
| -1.109999999999994 | -0.202 | -0.148 | -0.112 |
| -1.106999999999994 | -0.203 | -0.149 | -0.113 |
| -1.103999999999995 | -0.204 | -0.15 | -0.114 |
| -1.100999999999995 | -0.206 | -0.151 | -0.114 |
| -1.097999999999995 | -0.208 | -0.152 | -0.115 |
| -1.094999999999995 | -0.209 | -0.153 | -0.116 |
| -1.091999999999995 | -0.211 | -0.154 | -0.117 |
| -1.088999999999995 | -0.212 | -0.155 | -0.117 |
| -1.085999999999995 | -0.214 | -0.156 | -0.118 |
| -1.082999999999995 | -0.215 | -0.157 | -0.119 |
| -1.079999999999995 | -0.217 | -0.158 | -0.12 |
| -1.076999999999996 | -0.219 | -0.159 | -0.12 |
| -1.073999999999996 | -0.22 | -0.16 | -0.121 |
| -1.070999999999996 | -0.222 | -0.161 | -0.122 |
| -1.067999999999996 | -0.224 | -0.162 | -0.123 |
| -1.064999999999996 | -0.225 | -0.163 | -0.123 |
| -1.061999999999996 | -0.227 | -0.164 | -0.124 |
| -1.058999999999996 | -0.229 | -0.165 | -0.125 |
| -1.055999999999996 | -0.23 | -0.166 | -0.126 |
| -1.052999999999996 | -0.232 | -0.167 | -0.127 |
| -1.049999999999996 | -0.234 | -0.169 | -0.127 |
| -1.046999999999997 | -0.236 | -0.17 | -0.128 |
| -1.043999999999997 | -0.238 | -0.171 | -0.129 |
| -1.040999999999997 | -0.239 | -0.172 | -0.13 |
| -1.037999999999997 | -0.241 | -0.173 | -0.131 |
| -1.034999999999997 | -0.243 | -0.174 | -0.132 |
| -1.031999999999997 | -0.245 | -0.176 | -0.132 |
| -1.028999999999997 | -0.247 | -0.177 | -0.133 |
| -1.025999999999997 | -0.249 | -0.178 | -0.134 |
| -1.022999999999997 | -0.251 | -0.179 | -0.135 |
| -1.019999999999998 | -0.253 | -0.181 | -0.136 |
| -1.016999999999998 | -0.255 | -0.182 | -0.137 |
| -1.013999999999998 | -0.257 | -0.183 | -0.138 |
| -1.010999999999998 | -0.259 | -0.184 | -0.139 |
| -1.007999999999998 | -0.261 | -0.186 | -0.14 |
| -1.004999999999998 | -0.263 | -0.187 | -0.14 |
| -1.001999999999998 | -0.265 | -0.188 | -0.141 |
| -0.998999999999998 | -0.267 | -0.19 | -0.142 |
| -0.995999999999998 | -0.269 | -0.191 | -0.143 |
| -0.992999999999998 | -0.271 | -0.192 | -0.144 |
| -0.989999999999998 | -0.274 | -0.194 | -0.145 |
| -0.986999999999998 | -0.276 | -0.195 | -0.146 |
| -0.983999999999998 | -0.278 | -0.197 | -0.147 |
| -0.980999999999998 | -0.28 | -0.198 | -0.148 |
| -0.977999999999998 | -0.283 | -0.199 | -0.149 |
| -0.974999999999998 | -0.285 | -0.201 | -0.15 |
| -0.971999999999998 | -0.287 | -0.202 | -0.151 |
| -0.968999999999998 | -0.29 | -0.204 | -0.152 |
| -0.965999999999998 | -0.292 | -0.205 | -0.153 |
| -0.962999999999998 | -0.294 | -0.207 | -0.154 |
| -0.959999999999998 | -0.297 | -0.208 | -0.155 |
| -0.956999999999998 | -0.299 | -0.21 | -0.157 |
| -0.953999999999998 | -0.302 | -0.211 | -0.158 |
| -0.950999999999998 | -0.304 | -0.213 | -0.159 |
| -0.947999999999998 | -0.307 | -0.215 | -0.16 |
| -0.944999999999998 | -0.309 | -0.216 | -0.161 |
| -0.941999999999998 | -0.312 | -0.218 | -0.162 |
| -0.938999999999998 | -0.315 | -0.219 | -0.163 |
| -0.935999999999998 | -0.317 | -0.221 | -0.164 |
| -0.932999999999998 | -0.32 | -0.223 | -0.166 |
| -0.929999999999998 | -0.323 | -0.224 | -0.167 |
| -0.926999999999998 | -0.325 | -0.226 | -0.168 |
| -0.923999999999998 | -0.328 | -0.228 | -0.169 |
| -0.920999999999998 | -0.331 | -0.23 | -0.17 |
| -0.917999999999998 | -0.334 | -0.231 | -0.172 |
| -0.914999999999998 | -0.337 | -0.233 | -0.173 |
| -0.911999999999998 | -0.34 | -0.235 | -0.174 |
| -0.908999999999998 | -0.343 | -0.237 | -0.175 |
| -0.905999999999998 | -0.346 | -0.239 | -0.177 |
| -0.902999999999998 | -0.349 | -0.24 | -0.178 |
| -0.899999999999998 | -0.352 | -0.242 | -0.179 |
| -0.896999999999998 | -0.355 | -0.244 | -0.181 |
| -0.893999999999998 | -0.358 | -0.246 | -0.182 |
| -0.890999999999998 | -0.361 | -0.248 | -0.183 |
| -0.887999999999998 | -0.364 | -0.25 | -0.185 |
| -0.884999999999998 | -0.367 | -0.252 | -0.186 |
| -0.881999999999998 | -0.371 | -0.254 | -0.187 |
| -0.878999999999998 | -0.374 | -0.256 | -0.189 |
| -0.875999999999998 | -0.377 | -0.258 | -0.19 |
| -0.872999999999998 | -0.381 | -0.26 | -0.192 |
| -0.869999999999998 | -0.384 | -0.262 | -0.193 |
| -0.866999999999998 | -0.387 | -0.264 | -0.195 |
| -0.863999999999998 | -0.391 | -0.266 | -0.196 |
| -0.860999999999998 | -0.395 | -0.268 | -0.198 |
| -0.857999999999998 | -0.398 | -0.271 | -0.199 |
| -0.854999999999998 | -0.402 | -0.273 | -0.201 |
| -0.851999999999998 | -0.405 | -0.275 | -0.202 |
| -0.848999999999998 | -0.409 | -0.277 | -0.204 |
| -0.845999999999998 | -0.413 | -0.28 | -0.205 |
| -0.842999999999998 | -0.417 | -0.282 | -0.207 |
| -0.839999999999998 | -0.421 | -0.284 | -0.209 |
| -0.836999999999998 | -0.424 | -0.287 | -0.21 |
| -0.833999999999998 | -0.428 | -0.289 | -0.212 |
| -0.830999999999998 | -0.432 | -0.291 | -0.213 |
| -0.827999999999998 | -0.436 | -0.294 | -0.215 |
| -0.824999999999998 | -0.44 | -0.296 | -0.217 |
| -0.821999999999998 | -0.445 | -0.299 | -0.219 |
| -0.818999999999998 | -0.449 | -0.301 | -0.22 |
| -0.815999999999998 | -0.453 | -0.304 | -0.222 |
| -0.812999999999998 | -0.457 | -0.306 | -0.224 |
| -0.809999999999998 | -0.462 | -0.309 | -0.226 |
| -0.806999999999998 | -0.466 | -0.312 | -0.228 |
| -0.803999999999998 | -0.471 | -0.314 | -0.229 |
| -0.800999999999998 | -0.475 | -0.317 | -0.231 |
| -0.797999999999998 | -0.48 | -0.32 | -0.233 |
| -0.794999999999998 | -0.484 | -0.322 | -0.235 |
| -0.791999999999998 | -0.489 | -0.325 | -0.237 |
| -0.788999999999998 | -0.494 | -0.328 | -0.239 |
| -0.785999999999998 | -0.499 | -0.331 | -0.241 |
| -0.782999999999998 | -0.504 | -0.334 | -0.243 |
| -0.779999999999998 | -0.509 | -0.337 | -0.245 |
| -0.776999999999998 | -0.514 | -0.34 | -0.247 |
| -0.773999999999998 | -0.519 | -0.343 | -0.249 |
| -0.770999999999998 | -0.524 | -0.346 | -0.251 |
| -0.767999999999998 | -0.529 | -0.349 | -0.253 |
| -0.764999999999998 | -0.534 | -0.352 | -0.255 |
| -0.761999999999998 | -0.54 | -0.355 | -0.258 |
| -0.758999999999998 | -0.545 | -0.358 | -0.26 |
| -0.755999999999998 | -0.551 | -0.361 | -0.262 |
| -0.752999999999998 | -0.556 | -0.365 | -0.264 |
| -0.749999999999998 | -0.562 | -0.368 | -0.267 |
| -0.746999999999998 | -0.568 | -0.371 | -0.269 |
| -0.743999999999998 | -0.573 | -0.375 | -0.271 |
| -0.740999999999998 | -0.579 | -0.378 | -0.274 |
| -0.737999999999998 | -0.585 | -0.382 | -0.276 |
| -0.734999999999998 | -0.591 | -0.385 | -0.278 |
| -0.731999999999998 | -0.597 | -0.389 | -0.281 |
| -0.728999999999998 | -0.604 | -0.392 | -0.283 |
| -0.725999999999998 | -0.61 | -0.396 | -0.286 |
| -0.722999999999998 | -0.616 | -0.4 | -0.289 |
| -0.719999999999998 | -0.623 | -0.403 | -0.291 |
| -0.716999999999998 | -0.629 | -0.407 | -0.294 |
| -0.713999999999998 | -0.636 | -0.411 | -0.296 |
| -0.710999999999998 | -0.643 | -0.415 | -0.299 |
| -0.707999999999998 | -0.65 | -0.419 | -0.302 |
| -0.704999999999998 | -0.657 | -0.423 | -0.305 |
| -0.701999999999998 | -0.664 | -0.427 | -0.307 |
| -0.698999999999998 | -0.671 | -0.431 | -0.31 |
| -0.695999999999998 | -0.678 | -0.435 | -0.313 |
| -0.692999999999998 | -0.685 | -0.44 | -0.316 |
| -0.689999999999998 | -0.693 | -0.444 | -0.319 |
| -0.686999999999998 | -0.7 | -0.448 | -0.322 |
| -0.683999999999998 | -0.708 | -0.453 | -0.325 |
| -0.680999999999998 | -0.716 | -0.457 | -0.328 |
| -0.677999999999998 | -0.724 | -0.462 | -0.331 |
| -0.674999999999998 | -0.732 | -0.466 | -0.334 |
| -0.671999999999998 | -0.74 | -0.471 | -0.337 |
| -0.668999999999998 | -0.748 | -0.476 | -0.341 |
| -0.665999999999998 | -0.757 | -0.48 | -0.344 |
| -0.662999999999998 | -0.765 | -0.485 | -0.347 |
| -0.659999999999998 | -0.774 | -0.49 | -0.351 |
| -0.656999999999998 | -0.783 | -0.495 | -0.354 |
| -0.653999999999998 | -0.791 | -0.5 | -0.358 |
| -0.650999999999998 | -0.8 | -0.505 | -0.361 |
| -0.647999999999998 | -0.81 | -0.511 | -0.365 |
| -0.644999999999998 | -0.819 | -0.516 | -0.368 |
| -0.641999999999998 | -0.828 | -0.521 | -0.372 |
| -0.638999999999998 | -0.838 | -0.527 | -0.376 |
| -0.635999999999998 | -0.848 | -0.532 | -0.379 |
| -0.632999999999998 | -0.858 | -0.538 | -0.383 |
| -0.629999999999998 | -0.868 | -0.543 | -0.387 |
| -0.626999999999998 | -0.878 | -0.549 | -0.391 |
| -0.623999999999998 | -0.888 | -0.555 | -0.395 |
| -0.620999999999998 | -0.899 | -0.561 | -0.399 |
| -0.617999999999998 | -0.91 | -0.567 | -0.403 |
| -0.614999999999998 | -0.921 | -0.573 | -0.407 |
| -0.611999999999998 | -0.932 | -0.579 | -0.412 |
| -0.608999999999998 | -0.943 | -0.586 | -0.416 |
| -0.605999999999998 | -0.954 | -0.592 | -0.42 |
| -0.602999999999998 | -0.966 | -0.598 | -0.425 |
| -0.599999999999998 | -0.978 | -0.605 | -0.429 |
| -0.596999999999998 | -0.99 | -0.612 | -0.434 |
| -0.593999999999998 | -1.002 | -0.619 | -0.439 |
| -0.590999999999998 | -1.014 | -0.626 | -0.443 |
| -0.587999999999998 | -1.027 | -0.633 | -0.448 |
| -0.584999999999998 | -1.04 | -0.64 | -0.453 |
| -0.581999999999998 | -1.053 | -0.647 | -0.458 |
| -0.578999999999998 | -1.066 | -0.654 | -0.463 |
| -0.575999999999998 | -1.08 | -0.662 | -0.468 |
| -0.572999999999998 | -1.093 | -0.669 | -0.473 |
| -0.569999999999998 | -1.107 | -0.677 | -0.478 |
| -0.566999999999998 | -1.122 | -0.685 | -0.484 |
| -0.563999999999998 | -1.136 | -0.693 | -0.489 |
| -0.560999999999998 | -1.151 | -0.701 | -0.495 |
| -0.557999999999998 | -1.166 | -0.709 | -0.5 |
| -0.554999999999998 | -1.181 | -0.718 | -0.506 |
| -0.551999999999998 | -1.196 | -0.726 | -0.512 |
| -0.548999999999998 | -1.212 | -0.735 | -0.518 |
| -0.545999999999998 | -1.228 | -0.744 | -0.524 |
| -0.542999999999998 | -1.244 | -0.753 | -0.53 |
| -0.539999999999998 | -1.261 | -0.762 | -0.536 |
| -0.536999999999998 | -1.278 | -0.771 | -0.542 |
| -0.533999999999998 | -1.295 | -0.78 | -0.549 |
| -0.530999999999998 | -1.313 | -0.79 | -0.555 |
| -0.527999999999998 | -1.331 | -0.8 | -0.562 |
| -0.524999999999998 | -1.349 | -0.81 | -0.569 |
| -0.521999999999998 | -1.367 | -0.82 | -0.575 |
| -0.518999999999998 | -1.386 | -0.83 | -0.582 |
| -0.515999999999998 | -1.405 | -0.841 | -0.59 |
| -0.512999999999998 | -1.425 | -0.851 | -0.597 |
| -0.509999999999998 | -1.445 | -0.862 | -0.604 |
| -0.506999999999998 | -1.465 | -0.873 | -0.612 |
| -0.503999999999998 | -1.486 | -0.885 | -0.619 |
| -0.500999999999998 | -1.507 | -0.896 | -0.627 |
| -0.497999999999998 | -1.529 | -0.908 | -0.635 |
| -0.494999999999998 | -1.551 | -0.92 | -0.643 |
| -0.491999999999998 | -1.573 | -0.932 | -0.651 |
| -0.488999999999998 | -1.596 | -0.944 | -0.66 |
| -0.485999999999998 | -1.619 | -0.957 | -0.668 |
| -0.482999999999998 | -1.643 | -0.969 | -0.677 |
| -0.479999999999998 | -1.667 | -0.982 | -0.686 |
| -0.476999999999998 | -1.692 | -0.996 | -0.695 |
| -0.473999999999998 | -1.717 | -1.009 | -0.704 |
| -0.470999999999998 | -1.743 | -1.023 | -0.713 |
| -0.467999999999998 | -1.769 | -1.037 | -0.723 |
| -0.464999999999998 | -1.796 | -1.052 | -0.733 |
| -0.461999999999998 | -1.823 | -1.066 | -0.742 |
| -0.458999999999998 | -1.851 | -1.081 | -0.753 |
| -0.455999999999998 | -1.879 | -1.097 | -0.763 |
| -0.452999999999998 | -1.909 | -1.112 | -0.773 |
| -0.449999999999998 | -1.938 | -1.128 | -0.784 |
| -0.446999999999998 | -1.969 | -1.144 | -0.795 |
| -0.443999999999998 | -2 | -1.161 | -0.806 |
| -0.440999999999998 | -2.031 | -1.178 | -0.818 |
| -0.437999999999998 | -2.064 | -1.195 | -0.829 |
| -0.434999999999998 | -2.097 | -1.213 | -0.841 |
| -0.431999999999998 | -2.13 | -1.231 | -0.853 |
| -0.428999999999998 | -2.165 | -1.249 | -0.866 |
| -0.425999999999998 | -2.2 | -1.268 | -0.879 |
| -0.422999999999998 | -2.236 | -1.287 | -0.891 |
| -0.419999999999998 | -2.273 | -1.307 | -0.905 |
| -0.416999999999998 | -2.311 | -1.327 | -0.918 |
| -0.413999999999998 | -2.35 | -1.347 | -0.932 |
| -0.410999999999998 | -2.389 | -1.368 | -0.946 |
| -0.407999999999998 | -2.43 | -1.389 | -0.961 |
| -0.404999999999998 | -2.471 | -1.411 | -0.975 |
| -0.401999999999998 | -2.513 | -1.434 | -0.99 |
| -0.398999999999998 | -2.557 | -1.457 | -1.006 |
| -0.395999999999998 | -2.601 | -1.48 | -1.022 |
| -0.392999999999998 | -2.647 | -1.504 | -1.038 |
| -0.389999999999998 | -2.693 | -1.529 | -1.054 |
| -0.386999999999998 | -2.741 | -1.554 | -1.071 |
| -0.383999999999998 | -2.79 | -1.579 | -1.089 |
| -0.380999999999998 | -2.84 | -1.606 | -1.106 |
| -0.377999999999998 | -2.891 | -1.633 | -1.124 |
| -0.374999999999998 | -2.944 | -1.66 | -1.143 |
| -0.371999999999998 | -2.998 | -1.689 | -1.162 |
| -0.368999999999998 | -3.053 | -1.718 | -1.182 |
| -0.365999999999998 | -3.11 | -1.747 | -1.202 |
| -0.362999999999998 | -3.168 | -1.778 | -1.222 |
| -0.359999999999998 | -3.228 | -1.809 | -1.243 |
| -0.356999999999998 | -3.289 | -1.841 | -1.265 |
| -0.353999999999998 | -3.352 | -1.874 | -1.287 |
| -0.350999999999998 | -3.416 | -1.908 | -1.309 |
| -0.347999999999998 | -3.483 | -1.942 | -1.333 |
| -0.344999999999998 | -3.551 | -1.978 | -1.357 |
| -0.341999999999998 | -3.621 | -2.014 | -1.381 |
| -0.338999999999998 | -3.693 | -2.052 | -1.406 |
| -0.335999999999998 | -3.767 | -2.09 | -1.432 |
| -0.332999999999998 | -3.843 | -2.13 | -1.459 |
| -0.329999999999998 | -3.921 | -2.17 | -1.486 |
| -0.326999999999998 | -4.001 | -2.212 | -1.514 |
| -0.323999999999998 | -4.084 | -2.255 | -1.543 |
| -0.320999999999998 | -4.169 | -2.299 | -1.572 |
| -0.317999999999998 | -4.257 | -2.345 | -1.603 |
| -0.314999999999998 | -4.347 | -2.391 | -1.634 |
| -0.311999999999998 | -4.44 | -2.439 | -1.667 |
| -0.308999999999998 | -4.536 | -2.489 | -1.7 |
| -0.305999999999998 | -4.634 | -2.54 | -1.734 |
| -0.302999999999998 | -4.736 | -2.592 | -1.769 |
| -0.299999999999998 | -4.841 | -2.647 | -1.806 |
| -0.296999999999998 | -4.949 | -2.702 | -1.843 |
| -0.293999999999998 | -5.06 | -2.76 | -1.882 |
| -0.290999999999998 | -5.175 | -2.819 | -1.921 |
| -0.287999999999998 | -5.294 | -2.88 | -1.962 |
| -0.284999999999998 | -5.417 | -2.944 | -2.005 |
| -0.281999999999998 | -5.543 | -3.009 | -2.048 |
| -0.278999999999998 | -5.674 | -3.076 | -2.093 |
| -0.275999999999998 | -5.81 | -3.146 | -2.14 |
| -0.272999999999998 | -5.95 | -3.217 | -2.188 |
| -0.269999999999998 | -6.094 | -3.292 | -2.238 |
| -0.266999999999998 | -6.244 | -3.369 | -2.289 |
| -0.263999999999998 | -6.399 | -3.448 | -2.343 |
| -0.260999999999998 | -6.559 | -3.53 | -2.398 |
| -0.257999999999998 | -6.725 | -3.615 | -2.455 |
| -0.254999999999998 | -6.898 | -3.703 | -2.514 |
| -0.251999999999998 | -7.076 | -3.795 | -2.575 |
| -0.248999999999998 | -7.261 | -3.89 | -2.638 |
| -0.245999999999998 | -7.453 | -3.988 | -2.704 |
| -0.242999999999998 | -7.653 | -4.09 | -2.772 |
| -0.239999999999998 | -7.86 | -4.195 | -2.843 |
| -0.236999999999998 | -8.075 | -4.305 | -2.917 |
| -0.233999999999998 | -8.299 | -4.419 | -2.993 |
| -0.230999999999998 | -8.531 | -4.538 | -3.072 |
| -0.227999999999998 | -8.773 | -4.661 | -3.155 |
| -0.224999999999998 | -9.025 | -4.789 | -3.241 |
| -0.221999999999998 | -9.287 | -4.923 | -3.33 |
| -0.218999999999998 | -9.56 | -5.062 | -3.423 |
| -0.215999999999998 | -9.845 | -5.207 | -3.52 |
| -0.212999999999998 | -10.143 | -5.358 | -3.621 |
| -0.209999999999998 | -10.453 | -5.516 | -3.726 |
| -0.206999999999998 | -10.777 | -5.68 | -3.837 |
| -0.203999999999998 | -11.116 | -5.852 | -3.951 |
| -0.200999999999998 | -11.47 | -6.032 | -4.072 |
| -0.197999999999997 | -11.84 | -6.22 | -4.197 |
| -0.194999999999997 | -12.228 | -6.417 | -4.329 |
| -0.191999999999997 | -12.635 | -6.623 | -4.467 |
| -0.188999999999997 | -13.061 | -6.839 | -4.611 |
| -0.185999999999997 | -13.509 | -7.066 | -4.762 |
| -0.182999999999997 | -13.978 | -7.303 | -4.921 |
| -0.179999999999997 | -14.472 | -7.553 | -5.088 |
| -0.176999999999997 | -14.991 | -7.816 | -5.264 |
| -0.173999999999997 | -15.538 | -8.093 | -5.449 |
| -0.170999999999997 | -16.114 | -8.384 | -5.643 |
| -0.167999999999997 | -16.722 | -8.691 | -5.848 |
| -0.164999999999997 | -17.363 | -9.015 | -6.065 |
| -0.161999999999997 | -18.04 | -9.357 | -6.293 |
| -0.158999999999997 | -18.757 | -9.718 | -6.535 |
| -0.155999999999997 | -19.516 | -10.101 | -6.79 |
| -0.152999999999997 | -20.32 | -10.507 | -7.061 |
| -0.149999999999997 | -21.173 | -10.937 | -7.348 |
| -0.146999999999997 | -22.079 | -11.394 | -7.653 |
| -0.143999999999997 | -23.043 | -11.88 | -7.978 |
| -0.140999999999997 | -24.07 | -12.397 | -8.323 |
| -0.137999999999997 | -25.165 | -12.948 | -8.691 |
| -0.134999999999997 | -26.334 | -13.537 | -9.084 |
| -0.131999999999997 | -27.584 | -14.166 | -9.504 |
| -0.128999999999997 | -28.923 | -14.84 | -9.954 |
| -0.125999999999997 | -30.359 | -15.562 | -10.436 |
| -0.122999999999997 | -31.902 | -16.338 | -10.954 |
| -0.119999999999997 | -33.563 | -17.173 | -11.511 |
| -0.116999999999997 | -35.354 | -18.073 | -12.112 |
| -0.113999999999997 | -37.289 | -19.045 | -12.76 |
| -0.110999999999997 | -39.383 | -20.098 | -13.462 |
| -0.107999999999997 | -41.655 | -21.239 | -14.224 |
| -0.104999999999997 | -44.126 | -22.479 | -15.051 |
| -0.101999999999997 | -46.819 | -23.831 | -15.953 |
| -0.0989999999999974 | -49.76 | -25.308 | -16.938 |
| -0.0959999999999974 | -52.983 | -26.925 | -18.017 |
| -0.0929999999999974 | -56.524 | -28.701 | -19.202 |
| -0.0899999999999974 | -60.426 | -30.658 | -20.508 |
| -0.0869999999999974 | -64.74 | -32.821 | -21.95 |
| -0.0839999999999974 | -69.525 | -35.221 | -23.551 |
| -0.0809999999999974 | -74.853 | -37.891 | -25.332 |
| -0.0779999999999974 | -80.81 | -40.877 | -27.323 |
| -0.0749999999999974 | -87.496 | -44.227 | -29.558 |
| -0.0719999999999974 | -95.038 | -48.005 | -32.078 |
| -0.0689999999999974 | -103.586 | -52.287 | -34.933 |
| -0.0659999999999974 | -113.328 | -57.167 | -38.187 |
| -0.0629999999999974 | -124.497 | -62.76 | -41.917 |
| -0.0599999999999974 | -137.385 | -69.213 | -46.22 |
| -0.0569999999999974 | -152.364 | -76.712 | -51.221 |
| -0.0539999999999974 | -169.911 | -85.496 | -57.078 |
| -0.0509999999999974 | -190.649 | -95.875 | -63.999 |
| -0.0479999999999974 | -215.399 | -108.262 | -72.258 |
| -0.0449999999999974 | -245.266 | -123.208 | -82.223 |
| -0.0419999999999974 | -281.765 | -141.47 | -94.4 |
| -0.0389999999999974 | -327.012 | -164.107 | -109.493 |
| -0.0359999999999974 | -384.044 | -192.638 | -128.515 |
| -0.0329999999999974 | -457.334 | -229.3 | -152.959 |
| -0.0299999999999974 | -553.706 | -277.503 | -185.096 |
| -0.0269999999999974 | -683.968 | -342.654 | -228.533 |
| -0.0239999999999974 | -866.094 | -433.739 | -289.259 |
| -0.0209999999999974 | -1131.759 | -566.597 | -377.833 |
| -0.0179999999999974 | -1541.105 | -771.298 | -514.305 |
| -0.0149999999999974 | -2220.026 | -1110.793 | -740.639 |
| -0.0119999999999974 | -3469.914 | -1735.779 | -1157.302 |
| -0.00899999999999737 | -6170.388 | -3086.07 | -2057.502 |
| -0.00599999999999737 | -13886.234 | -6944.069 | -4629.511 |
| -0.00299999999999737 | -55552.554 | -27777.359 | -18518.387 |
| 2.62897342784285e-15 | -72343182679501697598529470464 | -36171591339750901575822868480 | -24114394226500598118517571584 |
| 0.00300000000000263 | -55552.554 | -27777.359 | -18518.387 |
| 0.00600000000000263 | -13886.234 | -6944.069 | -4629.511 |
| 0.00900000000000263 | -6170.388 | -3086.07 | -2057.502 |
| 0.0120000000000026 | -3469.914 | -1735.779 | -1157.302 |
| 0.0150000000000026 | -2220.026 | -1110.793 | -740.639 |
| 0.0180000000000026 | -1541.105 | -771.298 | -514.305 |
| 0.0210000000000026 | -1131.759 | -566.597 | -377.833 |
| 0.0240000000000026 | -866.094 | -433.739 | -289.259 |
| 0.0270000000000026 | -683.968 | -342.654 | -228.533 |
| 0.0300000000000026 | -553.706 | -277.503 | -185.096 |
| 0.0330000000000026 | -457.334 | -229.3 | -152.959 |
| 0.0360000000000026 | -384.044 | -192.638 | -128.515 |
| 0.0390000000000026 | -327.012 | -164.107 | -109.493 |
| 0.0420000000000026 | -281.765 | -141.47 | -94.4 |
| 0.0450000000000026 | -245.266 | -123.208 | -82.223 |
| 0.0480000000000026 | -215.399 | -108.262 | -72.258 |
| 0.0510000000000026 | -190.649 | -95.875 | -63.999 |
| 0.0540000000000026 | -169.911 | -85.496 | -57.078 |
| 0.0570000000000026 | -152.364 | -76.712 | -51.221 |
| 0.0600000000000026 | -137.385 | -69.213 | -46.22 |
| 0.0630000000000026 | -124.497 | -62.76 | -41.917 |
| 0.0660000000000026 | -113.328 | -57.167 | -38.187 |
| 0.0690000000000026 | -103.586 | -52.287 | -34.933 |
| 0.0720000000000027 | -95.038 | -48.005 | -32.078 |
| 0.0750000000000027 | -87.496 | -44.227 | -29.558 |
| 0.0780000000000027 | -80.81 | -40.877 | -27.323 |
| 0.0810000000000027 | -74.853 | -37.891 | -25.332 |
| 0.0840000000000027 | -69.525 | -35.221 | -23.551 |
| 0.0870000000000027 | -64.74 | -32.821 | -21.95 |
| 0.0900000000000027 | -60.426 | -30.658 | -20.508 |
| 0.0930000000000027 | -56.524 | -28.701 | -19.202 |
| 0.0960000000000027 | -52.983 | -26.925 | -18.017 |
| 0.0990000000000027 | -49.76 | -25.308 | -16.938 |
| 0.102000000000003 | -46.819 | -23.831 | -15.953 |
| 0.105000000000003 | -44.126 | -22.479 | -15.051 |
| 0.108000000000003 | -41.655 | -21.239 | -14.224 |
| 0.111000000000003 | -39.383 | -20.098 | -13.462 |
| 0.114000000000003 | -37.289 | -19.045 | -12.76 |
| 0.117000000000003 | -35.354 | -18.073 | -12.112 |
| 0.120000000000003 | -33.563 | -17.173 | -11.511 |
| 0.123000000000003 | -31.902 | -16.338 | -10.954 |
| 0.126000000000003 | -30.359 | -15.562 | -10.436 |
| 0.129000000000003 | -28.923 | -14.84 | -9.954 |
| 0.132000000000003 | -27.584 | -14.166 | -9.504 |
| 0.135000000000003 | -26.334 | -13.537 | -9.084 |
| 0.138000000000003 | -25.165 | -12.948 | -8.691 |
| 0.141000000000003 | -24.07 | -12.397 | -8.323 |
| 0.144000000000003 | -23.043 | -11.88 | -7.978 |
| 0.147000000000003 | -22.079 | -11.394 | -7.653 |
| 0.150000000000003 | -21.173 | -10.937 | -7.348 |
| 0.153000000000003 | -20.32 | -10.507 | -7.061 |
| 0.156000000000003 | -19.516 | -10.101 | -6.79 |
| 0.159000000000003 | -18.757 | -9.718 | -6.535 |
| 0.162000000000003 | -18.04 | -9.357 | -6.293 |
| 0.165000000000003 | -17.363 | -9.015 | -6.065 |
| 0.168000000000003 | -16.722 | -8.691 | -5.848 |
| 0.171000000000003 | -16.114 | -8.384 | -5.643 |
| 0.174000000000003 | -15.538 | -8.093 | -5.449 |
| 0.177000000000003 | -14.991 | -7.816 | -5.264 |
| 0.180000000000003 | -14.472 | -7.553 | -5.088 |
| 0.183000000000003 | -13.978 | -7.303 | -4.921 |
| 0.186000000000003 | -13.509 | -7.066 | -4.762 |
| 0.189000000000003 | -13.061 | -6.839 | -4.611 |
| 0.192000000000003 | -12.635 | -6.623 | -4.467 |
| 0.195000000000003 | -12.228 | -6.417 | -4.329 |
| 0.198000000000003 | -11.84 | -6.22 | -4.197 |
| 0.201000000000003 | -11.47 | -6.032 | -4.072 |
| 0.204000000000003 | -11.116 | -5.852 | -3.951 |
| 0.207000000000003 | -10.777 | -5.68 | -3.837 |
| 0.210000000000003 | -10.453 | -5.516 | -3.726 |
| 0.213000000000003 | -10.143 | -5.358 | -3.621 |
| 0.216000000000003 | -9.845 | -5.207 | -3.52 |
| 0.219000000000003 | -9.56 | -5.062 | -3.423 |
| 0.222000000000003 | -9.287 | -4.923 | -3.33 |
| 0.225000000000003 | -9.025 | -4.789 | -3.241 |
| 0.228000000000003 | -8.773 | -4.661 | -3.155 |
| 0.231000000000003 | -8.531 | -4.538 | -3.072 |
| 0.234000000000003 | -8.299 | -4.419 | -2.993 |
| 0.237000000000003 | -8.075 | -4.305 | -2.917 |
| 0.240000000000003 | -7.86 | -4.195 | -2.843 |
| 0.243000000000003 | -7.653 | -4.09 | -2.772 |
| 0.246000000000003 | -7.453 | -3.988 | -2.704 |
| 0.249000000000003 | -7.261 | -3.89 | -2.638 |
| 0.252000000000003 | -7.076 | -3.795 | -2.575 |
| 0.255000000000003 | -6.898 | -3.703 | -2.514 |
| 0.258000000000003 | -6.725 | -3.615 | -2.455 |
| 0.261000000000003 | -6.559 | -3.53 | -2.398 |
| 0.264000000000003 | -6.399 | -3.448 | -2.343 |
| 0.267000000000003 | -6.244 | -3.369 | -2.289 |
| 0.270000000000003 | -6.094 | -3.292 | -2.238 |
| 0.273000000000003 | -5.95 | -3.217 | -2.188 |
| 0.276000000000003 | -5.81 | -3.146 | -2.14 |
| 0.279000000000003 | -5.674 | -3.076 | -2.093 |
| 0.282000000000003 | -5.543 | -3.009 | -2.048 |
| 0.285000000000003 | -5.417 | -2.944 | -2.005 |
| 0.288000000000003 | -5.294 | -2.88 | -1.962 |
| 0.291000000000003 | -5.175 | -2.819 | -1.921 |
| 0.294000000000003 | -5.06 | -2.76 | -1.882 |
| 0.297000000000003 | -4.949 | -2.702 | -1.843 |
| 0.300000000000003 | -4.841 | -2.647 | -1.806 |
| 0.303000000000003 | -4.736 | -2.592 | -1.769 |
| 0.306000000000003 | -4.634 | -2.54 | -1.734 |
| 0.309000000000003 | -4.536 | -2.489 | -1.7 |
| 0.312000000000003 | -4.44 | -2.439 | -1.667 |
| 0.315000000000003 | -4.347 | -2.391 | -1.634 |
| 0.318000000000003 | -4.257 | -2.345 | -1.603 |
| 0.321000000000003 | -4.169 | -2.299 | -1.572 |
| 0.324000000000003 | -4.084 | -2.255 | -1.543 |
| 0.327000000000003 | -4.001 | -2.212 | -1.514 |
| 0.330000000000003 | -3.921 | -2.17 | -1.486 |
| 0.333000000000003 | -3.843 | -2.13 | -1.459 |
| 0.336000000000003 | -3.767 | -2.09 | -1.432 |
| 0.339000000000003 | -3.693 | -2.052 | -1.406 |
| 0.342000000000003 | -3.621 | -2.014 | -1.381 |
| 0.345000000000003 | -3.551 | -1.978 | -1.357 |
| 0.348000000000003 | -3.483 | -1.942 | -1.333 |
| 0.351000000000003 | -3.416 | -1.908 | -1.309 |
| 0.354000000000003 | -3.352 | -1.874 | -1.287 |
| 0.357000000000003 | -3.289 | -1.841 | -1.265 |
| 0.360000000000003 | -3.228 | -1.809 | -1.243 |
| 0.363000000000003 | -3.168 | -1.778 | -1.222 |
| 0.366000000000003 | -3.11 | -1.747 | -1.202 |
| 0.369000000000003 | -3.053 | -1.718 | -1.182 |
| 0.372000000000003 | -2.998 | -1.689 | -1.162 |
| 0.375000000000003 | -2.944 | -1.66 | -1.143 |
| 0.378000000000003 | -2.891 | -1.633 | -1.124 |
| 0.381000000000003 | -2.84 | -1.606 | -1.106 |
| 0.384000000000003 | -2.79 | -1.579 | -1.089 |
| 0.387000000000003 | -2.741 | -1.554 | -1.071 |
| 0.390000000000003 | -2.693 | -1.529 | -1.054 |
| 0.393000000000003 | -2.647 | -1.504 | -1.038 |
| 0.396000000000003 | -2.601 | -1.48 | -1.022 |
| 0.399000000000003 | -2.557 | -1.457 | -1.006 |
| 0.402000000000003 | -2.513 | -1.434 | -0.99 |
| 0.405000000000003 | -2.471 | -1.411 | -0.975 |
| 0.408000000000003 | -2.43 | -1.389 | -0.961 |
| 0.411000000000003 | -2.389 | -1.368 | -0.946 |
| 0.414000000000003 | -2.35 | -1.347 | -0.932 |
| 0.417000000000003 | -2.311 | -1.327 | -0.918 |
| 0.420000000000003 | -2.273 | -1.307 | -0.905 |
| 0.423000000000003 | -2.236 | -1.287 | -0.891 |
| 0.426000000000003 | -2.2 | -1.268 | -0.879 |
| 0.429000000000003 | -2.165 | -1.249 | -0.866 |
| 0.432000000000003 | -2.13 | -1.231 | -0.853 |
| 0.435000000000003 | -2.097 | -1.213 | -0.841 |
| 0.438000000000003 | -2.064 | -1.195 | -0.829 |
| 0.441000000000003 | -2.031 | -1.178 | -0.818 |
| 0.444000000000003 | -2 | -1.161 | -0.806 |
| 0.447000000000003 | -1.969 | -1.144 | -0.795 |
| 0.450000000000003 | -1.938 | -1.128 | -0.784 |
| 0.453000000000003 | -1.909 | -1.112 | -0.773 |
| 0.456000000000003 | -1.879 | -1.097 | -0.763 |
| 0.459000000000003 | -1.851 | -1.081 | -0.753 |
| 0.462000000000003 | -1.823 | -1.066 | -0.742 |
| 0.465000000000003 | -1.796 | -1.052 | -0.733 |
| 0.468000000000003 | -1.769 | -1.037 | -0.723 |
| 0.471000000000003 | -1.743 | -1.023 | -0.713 |
| 0.474000000000003 | -1.717 | -1.009 | -0.704 |
| 0.477000000000003 | -1.692 | -0.996 | -0.695 |
| 0.480000000000003 | -1.667 | -0.982 | -0.686 |
| 0.483000000000003 | -1.643 | -0.969 | -0.677 |
| 0.486000000000003 | -1.619 | -0.957 | -0.668 |
| 0.489000000000003 | -1.596 | -0.944 | -0.66 |
| 0.492000000000003 | -1.573 | -0.932 | -0.651 |
| 0.495000000000003 | -1.551 | -0.92 | -0.643 |
| 0.498000000000003 | -1.529 | -0.908 | -0.635 |
| 0.501000000000003 | -1.507 | -0.896 | -0.627 |
| 0.504000000000003 | -1.486 | -0.885 | -0.619 |
| 0.507000000000003 | -1.465 | -0.873 | -0.612 |
| 0.510000000000003 | -1.445 | -0.862 | -0.604 |
| 0.513000000000003 | -1.425 | -0.851 | -0.597 |
| 0.516000000000003 | -1.405 | -0.841 | -0.59 |
| 0.519000000000003 | -1.386 | -0.83 | -0.582 |
| 0.522000000000003 | -1.367 | -0.82 | -0.575 |
| 0.525000000000003 | -1.349 | -0.81 | -0.569 |
| 0.528000000000003 | -1.331 | -0.8 | -0.562 |
| 0.531000000000003 | -1.313 | -0.79 | -0.555 |
| 0.534000000000003 | -1.295 | -0.78 | -0.549 |
| 0.537000000000003 | -1.278 | -0.771 | -0.542 |
| 0.540000000000003 | -1.261 | -0.762 | -0.536 |
| 0.543000000000003 | -1.244 | -0.753 | -0.53 |
| 0.546000000000003 | -1.228 | -0.744 | -0.524 |
| 0.549000000000003 | -1.212 | -0.735 | -0.518 |
| 0.552000000000003 | -1.196 | -0.726 | -0.512 |
| 0.555000000000003 | -1.181 | -0.718 | -0.506 |
| 0.558000000000003 | -1.166 | -0.709 | -0.5 |
| 0.561000000000003 | -1.151 | -0.701 | -0.495 |
| 0.564000000000003 | -1.136 | -0.693 | -0.489 |
| 0.567000000000003 | -1.122 | -0.685 | -0.484 |
| 0.570000000000003 | -1.107 | -0.677 | -0.478 |
| 0.573000000000003 | -1.093 | -0.669 | -0.473 |
| 0.576000000000003 | -1.08 | -0.662 | -0.468 |
| 0.579000000000003 | -1.066 | -0.654 | -0.463 |
| 0.582000000000003 | -1.053 | -0.647 | -0.458 |
| 0.585000000000003 | -1.04 | -0.64 | -0.453 |
| 0.588000000000003 | -1.027 | -0.633 | -0.448 |
| 0.591000000000003 | -1.014 | -0.626 | -0.443 |
| 0.594000000000003 | -1.002 | -0.619 | -0.439 |
| 0.597000000000003 | -0.99 | -0.612 | -0.434 |
| 0.600000000000003 | -0.978 | -0.605 | -0.429 |
| 0.603000000000003 | -0.966 | -0.598 | -0.425 |
| 0.606000000000003 | -0.954 | -0.592 | -0.42 |
| 0.609000000000003 | -0.943 | -0.586 | -0.416 |
| 0.612000000000003 | -0.932 | -0.579 | -0.412 |
| 0.615000000000003 | -0.921 | -0.573 | -0.407 |
| 0.618000000000003 | -0.91 | -0.567 | -0.403 |
| 0.621000000000003 | -0.899 | -0.561 | -0.399 |
| 0.624000000000003 | -0.888 | -0.555 | -0.395 |
| 0.627000000000003 | -0.878 | -0.549 | -0.391 |
| 0.630000000000003 | -0.868 | -0.543 | -0.387 |
| 0.633000000000003 | -0.858 | -0.538 | -0.383 |
| 0.636000000000003 | -0.848 | -0.532 | -0.379 |
| 0.639000000000003 | -0.838 | -0.527 | -0.376 |
| 0.642000000000003 | -0.828 | -0.521 | -0.372 |
| 0.645000000000003 | -0.819 | -0.516 | -0.368 |
| 0.648000000000003 | -0.81 | -0.511 | -0.365 |
| 0.651000000000003 | -0.8 | -0.505 | -0.361 |
| 0.654000000000003 | -0.791 | -0.5 | -0.358 |
| 0.657000000000003 | -0.783 | -0.495 | -0.354 |
| 0.660000000000003 | -0.774 | -0.49 | -0.351 |
| 0.663000000000003 | -0.765 | -0.485 | -0.347 |
| 0.666000000000003 | -0.757 | -0.48 | -0.344 |
| 0.669000000000003 | -0.748 | -0.476 | -0.341 |
| 0.672000000000003 | -0.74 | -0.471 | -0.337 |
| 0.675000000000003 | -0.732 | -0.466 | -0.334 |
| 0.678000000000003 | -0.724 | -0.462 | -0.331 |
| 0.681000000000003 | -0.716 | -0.457 | -0.328 |
| 0.684000000000003 | -0.708 | -0.453 | -0.325 |
| 0.687000000000003 | -0.7 | -0.448 | -0.322 |
| 0.690000000000003 | -0.693 | -0.444 | -0.319 |
| 0.693000000000003 | -0.685 | -0.44 | -0.316 |
| 0.696000000000003 | -0.678 | -0.435 | -0.313 |
| 0.699000000000003 | -0.671 | -0.431 | -0.31 |
| 0.702000000000003 | -0.664 | -0.427 | -0.307 |
| 0.705000000000003 | -0.657 | -0.423 | -0.305 |
| 0.708000000000003 | -0.65 | -0.419 | -0.302 |
| 0.711000000000003 | -0.643 | -0.415 | -0.299 |
| 0.714000000000003 | -0.636 | -0.411 | -0.296 |
| 0.717000000000003 | -0.629 | -0.407 | -0.294 |
| 0.720000000000003 | -0.623 | -0.403 | -0.291 |
| 0.723000000000003 | -0.616 | -0.4 | -0.289 |
| 0.726000000000003 | -0.61 | -0.396 | -0.286 |
| 0.729000000000003 | -0.604 | -0.392 | -0.283 |
| 0.732000000000003 | -0.597 | -0.389 | -0.281 |
| 0.735000000000003 | -0.591 | -0.385 | -0.278 |
| 0.738000000000003 | -0.585 | -0.382 | -0.276 |
| 0.741000000000003 | -0.579 | -0.378 | -0.274 |
| 0.744000000000003 | -0.573 | -0.375 | -0.271 |
| 0.747000000000003 | -0.568 | -0.371 | -0.269 |
| 0.750000000000003 | -0.562 | -0.368 | -0.267 |
| 0.753000000000003 | -0.556 | -0.365 | -0.264 |
| 0.756000000000003 | -0.551 | -0.361 | -0.262 |
| 0.759000000000003 | -0.545 | -0.358 | -0.26 |
| 0.762000000000003 | -0.54 | -0.355 | -0.258 |
| 0.765000000000003 | -0.534 | -0.352 | -0.255 |
| 0.768000000000003 | -0.529 | -0.349 | -0.253 |
| 0.771000000000003 | -0.524 | -0.346 | -0.251 |
| 0.774000000000003 | -0.519 | -0.343 | -0.249 |
| 0.777000000000003 | -0.514 | -0.34 | -0.247 |
| 0.780000000000003 | -0.509 | -0.337 | -0.245 |
| 0.783000000000003 | -0.504 | -0.334 | -0.243 |
| 0.786000000000003 | -0.499 | -0.331 | -0.241 |
| 0.789000000000003 | -0.494 | -0.328 | -0.239 |
| 0.792000000000003 | -0.489 | -0.325 | -0.237 |
| 0.795000000000003 | -0.484 | -0.322 | -0.235 |
| 0.798000000000003 | -0.48 | -0.32 | -0.233 |
| 0.801000000000003 | -0.475 | -0.317 | -0.231 |
| 0.804000000000003 | -0.471 | -0.314 | -0.229 |
| 0.807000000000003 | -0.466 | -0.312 | -0.228 |
| 0.810000000000003 | -0.462 | -0.309 | -0.226 |
| 0.813000000000003 | -0.457 | -0.306 | -0.224 |
| 0.816000000000003 | -0.453 | -0.304 | -0.222 |
| 0.819000000000003 | -0.449 | -0.301 | -0.22 |
| 0.822000000000003 | -0.445 | -0.299 | -0.219 |
| 0.825000000000003 | -0.44 | -0.296 | -0.217 |
| 0.828000000000003 | -0.436 | -0.294 | -0.215 |
| 0.831000000000003 | -0.432 | -0.291 | -0.213 |
| 0.834000000000003 | -0.428 | -0.289 | -0.212 |
| 0.837000000000003 | -0.424 | -0.287 | -0.21 |
| 0.840000000000003 | -0.421 | -0.284 | -0.209 |
| 0.843000000000003 | -0.417 | -0.282 | -0.207 |
| 0.846000000000003 | -0.413 | -0.28 | -0.205 |
| 0.849000000000003 | -0.409 | -0.277 | -0.204 |
| 0.852000000000003 | -0.405 | -0.275 | -0.202 |
| 0.855000000000003 | -0.402 | -0.273 | -0.201 |
| 0.858000000000003 | -0.398 | -0.271 | -0.199 |
| 0.861000000000003 | -0.395 | -0.268 | -0.198 |
| 0.864000000000003 | -0.391 | -0.266 | -0.196 |
| 0.867000000000003 | -0.387 | -0.264 | -0.195 |
| 0.870000000000003 | -0.384 | -0.262 | -0.193 |
| 0.873000000000003 | -0.381 | -0.26 | -0.192 |
| 0.876000000000003 | -0.377 | -0.258 | -0.19 |
| 0.879000000000003 | -0.374 | -0.256 | -0.189 |
| 0.882000000000003 | -0.371 | -0.254 | -0.187 |
| 0.885000000000003 | -0.367 | -0.252 | -0.186 |
| 0.888000000000003 | -0.364 | -0.25 | -0.185 |
| 0.891000000000003 | -0.361 | -0.248 | -0.183 |
| 0.894000000000003 | -0.358 | -0.246 | -0.182 |
| 0.897000000000003 | -0.355 | -0.244 | -0.181 |
| 0.900000000000003 | -0.352 | -0.242 | -0.179 |
| 0.903000000000003 | -0.349 | -0.24 | -0.178 |
| 0.906000000000003 | -0.346 | -0.239 | -0.177 |
| 0.909000000000003 | -0.343 | -0.237 | -0.175 |
| 0.912000000000003 | -0.34 | -0.235 | -0.174 |
| 0.915000000000003 | -0.337 | -0.233 | -0.173 |
| 0.918000000000003 | -0.334 | -0.231 | -0.172 |
| 0.921000000000003 | -0.331 | -0.23 | -0.17 |
| 0.924000000000003 | -0.328 | -0.228 | -0.169 |
| 0.927000000000003 | -0.325 | -0.226 | -0.168 |
| 0.930000000000003 | -0.323 | -0.224 | -0.167 |
| 0.933000000000003 | -0.32 | -0.223 | -0.166 |
| 0.936000000000003 | -0.317 | -0.221 | -0.164 |
| 0.939000000000003 | -0.315 | -0.219 | -0.163 |
| 0.942000000000003 | -0.312 | -0.218 | -0.162 |
| 0.945000000000003 | -0.309 | -0.216 | -0.161 |
| 0.948000000000003 | -0.307 | -0.215 | -0.16 |
| 0.951000000000003 | -0.304 | -0.213 | -0.159 |
| 0.954000000000003 | -0.302 | -0.211 | -0.158 |
| 0.957000000000003 | -0.299 | -0.21 | -0.157 |
| 0.960000000000003 | -0.297 | -0.208 | -0.155 |
| 0.963000000000003 | -0.294 | -0.207 | -0.154 |
| 0.966000000000003 | -0.292 | -0.205 | -0.153 |
| 0.969000000000003 | -0.29 | -0.204 | -0.152 |
| 0.972000000000003 | -0.287 | -0.202 | -0.151 |
| 0.975000000000003 | -0.285 | -0.201 | -0.15 |
| 0.978000000000003 | -0.283 | -0.199 | -0.149 |
| 0.981000000000003 | -0.28 | -0.198 | -0.148 |
| 0.984000000000003 | -0.278 | -0.197 | -0.147 |
| 0.987000000000003 | -0.276 | -0.195 | -0.146 |
| 0.990000000000003 | -0.274 | -0.194 | -0.145 |
| 0.993000000000003 | -0.271 | -0.192 | -0.144 |
| 0.996000000000003 | -0.269 | -0.191 | -0.143 |
| 0.999000000000003 | -0.267 | -0.19 | -0.142 |
| 1.002000000000003 | -0.265 | -0.188 | -0.141 |
| 1.005000000000003 | -0.263 | -0.187 | -0.14 |
| 1.008000000000003 | -0.261 | -0.186 | -0.14 |
| 1.011000000000003 | -0.259 | -0.184 | -0.139 |
| 1.014000000000003 | -0.257 | -0.183 | -0.138 |
| 1.017000000000003 | -0.255 | -0.182 | -0.137 |
| 1.020000000000003 | -0.253 | -0.181 | -0.136 |
| 1.023000000000003 | -0.251 | -0.179 | -0.135 |
| 1.026000000000002 | -0.249 | -0.178 | -0.134 |
| 1.029000000000002 | -0.247 | -0.177 | -0.133 |
| 1.032000000000002 | -0.245 | -0.176 | -0.132 |
| 1.035000000000002 | -0.243 | -0.174 | -0.132 |
| 1.038000000000002 | -0.241 | -0.173 | -0.131 |
| 1.041000000000002 | -0.239 | -0.172 | -0.13 |
| 1.044000000000002 | -0.238 | -0.171 | -0.129 |
| 1.047000000000002 | -0.236 | -0.17 | -0.128 |
| 1.050000000000002 | -0.234 | -0.169 | -0.127 |
| 1.053000000000001 | -0.232 | -0.167 | -0.127 |
| 1.056000000000001 | -0.23 | -0.166 | -0.126 |
| 1.059000000000001 | -0.229 | -0.165 | -0.125 |
| 1.062000000000001 | -0.227 | -0.164 | -0.124 |
| 1.065000000000001 | -0.225 | -0.163 | -0.123 |
| 1.068000000000001 | -0.224 | -0.162 | -0.123 |
| 1.071000000000001 | -0.222 | -0.161 | -0.122 |
| 1.074000000000001 | -0.22 | -0.16 | -0.121 |
| 1.077000000000001 | -0.219 | -0.159 | -0.12 |
| 1.08 | -0.217 | -0.158 | -0.12 |
| 1.083 | -0.215 | -0.157 | -0.119 |
| 1.086 | -0.214 | -0.156 | -0.118 |
| 1.089 | -0.212 | -0.155 | -0.117 |
| 1.092 | -0.211 | -0.154 | -0.117 |
| 1.095 | -0.209 | -0.153 | -0.116 |
| 1.098 | -0.208 | -0.152 | -0.115 |
| 1.101 | -0.206 | -0.151 | -0.114 |
| 1.104 | -0.204 | -0.15 | -0.114 |
| 1.107 | -0.203 | -0.149 | -0.113 |
| 1.109999999999999 | -0.202 | -0.148 | -0.112 |
| 1.112999999999999 | -0.2 | -0.147 | -0.112 |
| 1.115999999999999 | -0.199 | -0.146 | -0.111 |
| 1.118999999999999 | -0.197 | -0.145 | -0.11 |
| 1.121999999999999 | -0.196 | -0.144 | -0.11 |
| 1.124999999999999 | -0.194 | -0.143 | -0.109 |
| 1.127999999999999 | -0.193 | -0.142 | -0.108 |
| 1.130999999999999 | -0.192 | -0.141 | -0.108 |
| 1.133999999999999 | -0.19 | -0.14 | -0.107 |
| 1.136999999999998 | -0.189 | -0.139 | -0.106 |
| 1.139999999999998 | -0.188 | -0.138 | -0.106 |
| 1.142999999999998 | -0.186 | -0.138 | -0.105 |
| 1.145999999999998 | -0.185 | -0.137 | -0.105 |
| 1.148999999999998 | -0.184 | -0.136 | -0.104 |
| 1.151999999999998 | -0.182 | -0.135 | -0.103 |
| 1.154999999999998 | -0.181 | -0.134 | -0.103 |
| 1.157999999999998 | -0.18 | -0.133 | -0.102 |
| 1.160999999999998 | -0.178 | -0.132 | -0.102 |
| 1.163999999999997 | -0.177 | -0.132 | -0.101 |
| 1.166999999999997 | -0.176 | -0.131 | -0.1 |
| 1.169999999999997 | -0.175 | -0.13 | -0.1 |
| 1.172999999999997 | -0.174 | -0.129 | -0.099 |
| 1.175999999999997 | -0.172 | -0.128 | -0.099 |
| 1.178999999999997 | -0.171 | -0.128 | -0.098 |
| 1.181999999999997 | -0.17 | -0.127 | -0.097 |
| 1.184999999999997 | -0.169 | -0.126 | -0.097 |
| 1.187999999999997 | -0.168 | -0.125 | -0.096 |
| 1.190999999999996 | -0.167 | -0.124 | -0.096 |
| 1.193999999999996 | -0.165 | -0.124 | -0.095 |
| 1.196999999999996 | -0.164 | -0.123 | -0.095 |
| 1.199999999999996 | -0.163 | -0.122 | -0.094 |
| 1.202999999999996 | -0.162 | -0.121 | -0.094 |
| 1.205999999999996 | -0.161 | -0.121 | -0.093 |
| 1.208999999999996 | -0.16 | -0.12 | -0.093 |
| 1.211999999999996 | -0.159 | -0.119 | -0.092 |
| 1.214999999999996 | -0.158 | -0.119 | -0.092 |
| 1.217999999999996 | -0.157 | -0.118 | -0.091 |
| 1.220999999999995 | -0.156 | -0.117 | -0.09 |
| 1.223999999999995 | -0.155 | -0.116 | -0.09 |
| 1.226999999999995 | -0.154 | -0.116 | -0.089 |
| 1.229999999999995 | -0.153 | -0.115 | -0.089 |
| 1.232999999999995 | -0.151 | -0.114 | -0.088 |
| 1.235999999999995 | -0.15 | -0.114 | -0.088 |
| 1.238999999999995 | -0.149 | -0.113 | -0.088 |
| 1.241999999999995 | -0.149 | -0.112 | -0.087 |
| 1.244999999999995 | -0.148 | -0.112 | -0.087 |
| 1.247999999999994 | -0.147 | -0.111 | -0.086 |
| 1.250999999999994 | -0.146 | -0.11 | -0.086 |
| 1.253999999999994 | -0.145 | -0.11 | -0.085 |
| 1.256999999999994 | -0.144 | -0.109 | -0.085 |
| 1.259999999999994 | -0.143 | -0.108 | -0.084 |
| 1.262999999999994 | -0.142 | -0.108 | -0.084 |
| 1.265999999999994 | -0.141 | -0.107 | -0.083 |
| 1.268999999999994 | -0.14 | -0.107 | -0.083 |
| 1.271999999999994 | -0.139 | -0.106 | -0.082 |
| 1.274999999999993 | -0.138 | -0.105 | -0.082 |
| 1.277999999999993 | -0.137 | -0.105 | -0.081 |
| 1.280999999999993 | -0.136 | -0.104 | -0.081 |
| 1.283999999999993 | -0.136 | -0.104 | -0.081 |
| 1.286999999999993 | -0.135 | -0.103 | -0.08 |
| 1.289999999999993 | -0.134 | -0.102 | -0.08 |
| 1.292999999999993 | -0.133 | -0.102 | -0.079 |
| 1.295999999999993 | -0.132 | -0.101 | -0.079 |
| 1.298999999999993 | -0.131 | -0.101 | -0.078 |
| 1.301999999999992 | -0.13 | -0.1 | -0.078 |
| 1.304999999999992 | -0.13 | -0.099 | -0.078 |
| 1.307999999999992 | -0.129 | -0.099 | -0.077 |
| 1.310999999999992 | -0.128 | -0.098 | -0.077 |
| 1.313999999999992 | -0.127 | -0.098 | -0.076 |
| 1.316999999999992 | -0.126 | -0.097 | -0.076 |
| 1.319999999999992 | -0.126 | -0.097 | -0.076 |
| 1.322999999999992 | -0.125 | -0.096 | -0.075 |
| 1.325999999999992 | -0.124 | -0.096 | -0.075 |
| 1.328999999999991 | -0.123 | -0.095 | -0.074 |
| 1.331999999999991 | -0.123 | -0.095 | -0.074 |
| 1.334999999999991 | -0.122 | -0.094 | -0.074 |
| 1.337999999999991 | -0.121 | -0.094 | -0.073 |
| 1.340999999999991 | -0.12 | -0.093 | -0.073 |
| 1.343999999999991 | -0.12 | -0.092 | -0.073 |
| 1.346999999999991 | -0.119 | -0.092 | -0.072 |
| 1.349999999999991 | -0.118 | -0.091 | -0.072 |
| 1.352999999999991 | -0.117 | -0.091 | -0.071 |
| 1.35599999999999 | -0.117 | -0.09 | -0.071 |
| 1.35899999999999 | -0.116 | -0.09 | -0.071 |
| 1.36199999999999 | -0.115 | -0.089 | -0.07 |
| 1.36499999999999 | -0.114 | -0.089 | -0.07 |
| 1.36799999999999 | -0.114 | -0.089 | -0.07 |
| 1.37099999999999 | -0.113 | -0.088 | -0.069 |
| 1.37399999999999 | -0.112 | -0.088 | -0.069 |
| 1.37699999999999 | -0.112 | -0.087 | -0.069 |
| 1.37999999999999 | -0.111 | -0.087 | -0.068 |
| 1.38299999999999 | -0.11 | -0.086 | -0.068 |
| 1.385999999999989 | -0.11 | -0.086 | -0.068 |
| 1.388999999999989 | -0.109 | -0.085 | -0.067 |
| 1.391999999999989 | -0.108 | -0.085 | -0.067 |
| 1.394999999999989 | -0.108 | -0.084 | -0.067 |
| 1.397999999999989 | -0.107 | -0.084 | -0.066 |
| 1.400999999999989 | -0.107 | -0.083 | -0.066 |
| 1.403999999999989 | -0.106 | -0.083 | -0.066 |
| 1.406999999999989 | -0.105 | -0.083 | -0.065 |
| 1.409999999999989 | -0.105 | -0.082 | -0.065 |
| 1.412999999999988 | -0.104 | -0.082 | -0.065 |
| 1.415999999999988 | -0.103 | -0.081 | -0.064 |
| 1.418999999999988 | -0.103 | -0.081 | -0.064 |
| 1.421999999999988 | -0.102 | -0.08 | -0.064 |
| 1.424999999999988 | -0.102 | -0.08 | -0.063 |
| 1.427999999999988 | -0.101 | -0.079 | -0.063 |
| 1.430999999999988 | -0.1 | -0.079 | -0.063 |
| 1.433999999999988 | -0.1 | -0.079 | -0.062 |
| 1.436999999999988 | -0.099 | -0.078 | -0.062 |
| 1.439999999999987 | -0.099 | -0.078 | -0.062 |
| 1.442999999999987 | -0.098 | -0.077 | -0.061 |
| 1.445999999999987 | -0.098 | -0.077 | -0.061 |
| 1.448999999999987 | -0.097 | -0.077 | -0.061 |
| 1.451999999999987 | -0.096 | -0.076 | -0.061 |
| 1.454999999999987 | -0.096 | -0.076 | -0.06 |
| 1.457999999999987 | -0.095 | -0.075 | -0.06 |
| 1.460999999999987 | -0.095 | -0.075 | -0.06 |
| 1.463999999999987 | -0.094 | -0.075 | -0.059 |
| 1.466999999999987 | -0.094 | -0.074 | -0.059 |
| 1.469999999999986 | -0.093 | -0.074 | -0.059 |
| 1.472999999999986 | -0.093 | -0.074 | -0.059 |
| 1.475999999999986 | -0.092 | -0.073 | -0.058 |
| 1.478999999999986 | -0.092 | -0.073 | -0.058 |
| 1.481999999999986 | -0.091 | -0.072 | -0.058 |
| 1.484999999999986 | -0.091 | -0.072 | -0.057 |
| 1.487999999999986 | -0.09 | -0.072 | -0.057 |
| 1.490999999999986 | -0.09 | -0.071 | -0.057 |
| 1.493999999999986 | -0.089 | -0.071 | -0.057 |
| 1.496999999999985 | -0.089 | -0.071 | -0.056 |
| 1.499999999999985 | -0.088 | -0.07 | -0.056 |
| 1.502999999999985 | -0.088 | -0.07 | -0.056 |
| 1.505999999999985 | -0.087 | -0.07 | -0.056 |
| 1.508999999999985 | -0.087 | -0.069 | -0.055 |
| 1.511999999999985 | -0.086 | -0.069 | -0.055 |
| 1.514999999999985 | -0.086 | -0.068 | -0.055 |
| 1.517999999999985 | -0.085 | -0.068 | -0.055 |
| 1.520999999999985 | -0.085 | -0.068 | -0.054 |
| 1.523999999999984 | -0.084 | -0.067 | -0.054 |
| 1.526999999999984 | -0.084 | -0.067 | -0.054 |
| 1.529999999999984 | -0.083 | -0.067 | -0.054 |
| 1.532999999999984 | -0.083 | -0.066 | -0.053 |
| 1.535999999999984 | -0.082 | -0.066 | -0.053 |
| 1.538999999999984 | -0.082 | -0.066 | -0.053 |
| 1.541999999999984 | -0.081 | -0.065 | -0.053 |
| 1.544999999999984 | -0.081 | -0.065 | -0.052 |
| 1.547999999999984 | -0.081 | -0.065 | -0.052 |
| 1.550999999999983 | -0.08 | -0.065 | -0.052 |
| 1.553999999999983 | -0.08 | -0.064 | -0.052 |
| 1.556999999999983 | -0.079 | -0.064 | -0.051 |
| 1.559999999999983 | -0.079 | -0.064 | -0.051 |
| 1.562999999999983 | -0.078 | -0.063 | -0.051 |
| 1.565999999999983 | -0.078 | -0.063 | -0.051 |
| 1.568999999999983 | -0.078 | -0.063 | -0.05 |
| 1.571999999999983 | -0.077 | -0.062 | -0.05 |
| 1.574999999999983 | -0.077 | -0.062 | -0.05 |
| 1.577999999999983 | -0.076 | -0.062 | -0.05 |
| 1.580999999999982 | -0.076 | -0.061 | -0.05 |
| 1.583999999999982 | -0.076 | -0.061 | -0.049 |
| 1.586999999999982 | -0.075 | -0.061 | -0.049 |
| 1.589999999999982 | -0.075 | -0.061 | -0.049 |
| 1.592999999999982 | -0.074 | -0.06 | -0.049 |
| 1.595999999999982 | -0.074 | -0.06 | -0.048 |
| 1.598999999999982 | -0.074 | -0.06 | -0.048 |
| 1.601999999999982 | -0.073 | -0.059 | -0.048 |
| 1.604999999999981 | -0.073 | -0.059 | -0.048 |
| 1.607999999999981 | -0.072 | -0.059 | -0.048 |
| 1.610999999999981 | -0.072 | -0.059 | -0.047 |
| 1.613999999999981 | -0.072 | -0.058 | -0.047 |
| 1.616999999999981 | -0.071 | -0.058 | -0.047 |
| 1.619999999999981 | -0.071 | -0.058 | -0.047 |
| 1.622999999999981 | -0.071 | -0.057 | -0.046 |
| 1.625999999999981 | -0.07 | -0.057 | -0.046 |
| 1.628999999999981 | -0.07 | -0.057 | -0.046 |
| 1.63199999999998 | -0.069 | -0.057 | -0.046 |
| 1.63499999999998 | -0.069 | -0.056 | -0.046 |
| 1.63799999999998 | -0.069 | -0.056 | -0.045 |
| 1.64099999999998 | -0.068 | -0.056 | -0.045 |
| 1.64399999999998 | -0.068 | -0.056 | -0.045 |
| 1.64699999999998 | -0.068 | -0.055 | -0.045 |
| 1.64999999999998 | -0.067 | -0.055 | -0.045 |
| 1.65299999999998 | -0.067 | -0.055 | -0.045 |
| 1.65599999999998 | -0.067 | -0.055 | -0.044 |
| 1.65899999999998 | -0.066 | -0.054 | -0.044 |
| 1.661999999999979 | -0.066 | -0.054 | -0.044 |
| 1.664999999999979 | -0.066 | -0.054 | -0.044 |
| 1.667999999999979 | -0.065 | -0.054 | -0.044 |
| 1.670999999999979 | -0.065 | -0.053 | -0.043 |
| 1.673999999999979 | -0.065 | -0.053 | -0.043 |
| 1.676999999999979 | -0.064 | -0.053 | -0.043 |
| 1.679999999999979 | -0.064 | -0.053 | -0.043 |
| 1.682999999999979 | -0.064 | -0.052 | -0.043 |
| 1.685999999999979 | -0.063 | -0.052 | -0.042 |
| 1.688999999999978 | -0.063 | -0.052 | -0.042 |
| 1.691999999999978 | -0.063 | -0.052 | -0.042 |
| 1.694999999999978 | -0.062 | -0.051 | -0.042 |
| 1.697999999999978 | -0.062 | -0.051 | -0.042 |
| 1.700999999999978 | -0.062 | -0.051 | -0.042 |
| 1.703999999999978 | -0.061 | -0.051 | -0.041 |
| 1.706999999999978 | -0.061 | -0.05 | -0.041 |
| 1.709999999999978 | -0.061 | -0.05 | -0.041 |
| 1.712999999999978 | -0.061 | -0.05 | -0.041 |
| 1.715999999999977 | -0.06 | -0.05 | -0.041 |
| 1.718999999999977 | -0.06 | -0.05 | -0.04 |
| 1.721999999999977 | -0.06 | -0.049 | -0.04 |
| 1.724999999999977 | -0.059 | -0.049 | -0.04 |
| 1.727999999999977 | -0.059 | -0.049 | -0.04 |
| 1.730999999999977 | -0.059 | -0.049 | -0.04 |
| 1.733999999999977 | -0.058 | -0.048 | -0.04 |
| 1.736999999999977 | -0.058 | -0.048 | -0.039 |
| 1.739999999999977 | -0.058 | -0.048 | -0.039 |
| 1.742999999999976 | -0.058 | -0.048 | -0.039 |
| 1.745999999999976 | -0.057 | -0.048 | -0.039 |
| 1.748999999999976 | -0.057 | -0.047 | -0.039 |
| 1.751999999999976 | -0.057 | -0.047 | -0.039 |
| 1.754999999999976 | -0.057 | -0.047 | -0.039 |
| 1.757999999999976 | -0.056 | -0.047 | -0.038 |
| 1.760999999999976 | -0.056 | -0.047 | -0.038 |
| 1.763999999999976 | -0.056 | -0.046 | -0.038 |
| 1.766999999999976 | -0.055 | -0.046 | -0.038 |
| 1.769999999999976 | -0.055 | -0.046 | -0.038 |
| 1.772999999999975 | -0.055 | -0.046 | -0.038 |
| 1.775999999999975 | -0.055 | -0.046 | -0.037 |
| 1.778999999999975 | -0.054 | -0.045 | -0.037 |
| 1.781999999999975 | -0.054 | -0.045 | -0.037 |
| 1.784999999999975 | -0.054 | -0.045 | -0.037 |
| 1.787999999999975 | -0.054 | -0.045 | -0.037 |
| 1.790999999999975 | -0.053 | -0.045 | -0.037 |
| 1.793999999999975 | -0.053 | -0.044 | -0.037 |
| 1.796999999999975 | -0.053 | -0.044 | -0.036 |
| 1.799999999999974 | -0.053 | -0.044 | -0.036 |
| 1.802999999999974 | -0.052 | -0.044 | -0.036 |
| 1.805999999999974 | -0.052 | -0.044 | -0.036 |
| 1.808999999999974 | -0.052 | -0.043 | -0.036 |
| 1.811999999999974 | -0.052 | -0.043 | -0.036 |
| 1.814999999999974 | -0.051 | -0.043 | -0.035 |
| 1.817999999999974 | -0.051 | -0.043 | -0.035 |
| 1.820999999999974 | -0.051 | -0.043 | -0.035 |
| 1.823999999999974 | -0.051 | -0.042 | -0.035 |
| 1.826999999999973 | -0.05 | -0.042 | -0.035 |
| 1.829999999999973 | -0.05 | -0.042 | -0.035 |
| 1.832999999999973 | -0.05 | -0.042 | -0.035 |
| 1.835999999999973 | -0.05 | -0.042 | -0.035 |
| 1.838999999999973 | -0.049 | -0.042 | -0.034 |
| 1.841999999999973 | -0.049 | -0.041 | -0.034 |
| 1.844999999999973 | -0.049 | -0.041 | -0.034 |
| 1.847999999999973 | -0.049 | -0.041 | -0.034 |
| 1.850999999999973 | -0.049 | -0.041 | -0.034 |
| 1.853999999999973 | -0.048 | -0.041 | -0.034 |
| 1.856999999999972 | -0.048 | -0.041 | -0.034 |
| 1.859999999999972 | -0.048 | -0.04 | -0.033 |
| 1.862999999999972 | -0.048 | -0.04 | -0.033 |
| 1.865999999999972 | -0.047 | -0.04 | -0.033 |
| 1.868999999999972 | -0.047 | -0.04 | -0.033 |
| 1.871999999999972 | -0.047 | -0.04 | -0.033 |
| 1.874999999999972 | -0.047 | -0.039 | -0.033 |
| 1.877999999999972 | -0.047 | -0.039 | -0.033 |
| 1.880999999999972 | -0.046 | -0.039 | -0.033 |
| 1.883999999999971 | -0.046 | -0.039 | -0.032 |
| 1.886999999999971 | -0.046 | -0.039 | -0.032 |
| 1.889999999999971 | -0.046 | -0.039 | -0.032 |
| 1.892999999999971 | -0.046 | -0.039 | -0.032 |
| 1.895999999999971 | -0.045 | -0.038 | -0.032 |
| 1.898999999999971 | -0.045 | -0.038 | -0.032 |
| 1.901999999999971 | -0.045 | -0.038 | -0.032 |
| 1.904999999999971 | -0.045 | -0.038 | -0.032 |
| 1.907999999999971 | -0.045 | -0.038 | -0.031 |
| 1.91099999999997 | -0.044 | -0.038 | -0.031 |
| 1.91399999999997 | -0.044 | -0.037 | -0.031 |
| 1.91699999999997 | -0.044 | -0.037 | -0.031 |
| 1.91999999999997 | -0.044 | -0.037 | -0.031 |
| 1.92299999999997 | -0.044 | -0.037 | -0.031 |
| 1.92599999999997 | -0.043 | -0.037 | -0.031 |
| 1.92899999999997 | -0.043 | -0.037 | -0.031 |
| 1.93199999999997 | -0.043 | -0.036 | -0.03 |
| 1.93499999999997 | -0.043 | -0.036 | -0.03 |
| 1.937999999999969 | -0.043 | -0.036 | -0.03 |
| 1.940999999999969 | -0.042 | -0.036 | -0.03 |
| 1.943999999999969 | -0.042 | -0.036 | -0.03 |
| 1.946999999999969 | -0.042 | -0.036 | -0.03 |
| 1.949999999999969 | -0.042 | -0.036 | -0.03 |
| 1.952999999999969 | -0.042 | -0.035 | -0.03 |
| 1.955999999999969 | -0.041 | -0.035 | -0.03 |
| 1.958999999999969 | -0.041 | -0.035 | -0.029 |
| 1.961999999999969 | -0.041 | -0.035 | -0.029 |
| 1.964999999999969 | -0.041 | -0.035 | -0.029 |
| 1.967999999999968 | -0.041 | -0.035 | -0.029 |
| 1.970999999999968 | -0.041 | -0.035 | -0.029 |
| 1.973999999999968 | -0.04 | -0.034 | -0.029 |
| 1.976999999999968 | -0.04 | -0.034 | -0.029 |
| 1.979999999999968 | -0.04 | -0.034 | -0.029 |
| 1.982999999999968 | -0.04 | -0.034 | -0.029 |
| 1.985999999999968 | -0.04 | -0.034 | -0.028 |
| 1.988999999999968 | -0.04 | -0.034 | -0.028 |
| 1.991999999999968 | -0.039 | -0.034 | -0.028 |
| 1.994999999999967 | -0.039 | -0.034 | -0.028 |
| 1.997999999999967 | -0.039 | -0.033 | -0.028 |
| 2.000999999999967 | -0.039 | -0.033 | -0.028 |
| 2.003999999999968 | -0.039 | -0.033 | -0.028 |
| 2.006999999999968 | -0.039 | -0.033 | -0.028 |
| 2.009999999999968 | -0.038 | -0.033 | -0.028 |
| 2.012999999999968 | -0.038 | -0.033 | -0.028 |
| 2.015999999999968 | -0.038 | -0.033 | -0.027 |
| 2.018999999999968 | -0.038 | -0.032 | -0.027 |
| 2.021999999999968 | -0.038 | -0.032 | -0.027 |
| 2.024999999999968 | -0.038 | -0.032 | -0.027 |
| 2.027999999999968 | -0.037 | -0.032 | -0.027 |
| 2.030999999999969 | -0.037 | -0.032 | -0.027 |
| 2.033999999999969 | -0.037 | -0.032 | -0.027 |
| 2.036999999999969 | -0.037 | -0.032 | -0.027 |
| 2.039999999999969 | -0.037 | -0.032 | -0.027 |
| 2.042999999999969 | -0.037 | -0.031 | -0.027 |
| 2.045999999999969 | -0.036 | -0.031 | -0.026 |
| 2.048999999999969 | -0.036 | -0.031 | -0.026 |
| 2.051999999999969 | -0.036 | -0.031 | -0.026 |
| 2.05499999999997 | -0.036 | -0.031 | -0.026 |
| 2.05799999999997 | -0.036 | -0.031 | -0.026 |
| 2.06099999999997 | -0.036 | -0.031 | -0.026 |
| 2.06399999999997 | -0.036 | -0.031 | -0.026 |
| 2.06699999999997 | -0.035 | -0.031 | -0.026 |
| 2.06999999999997 | -0.035 | -0.03 | -0.026 |
| 2.07299999999997 | -0.035 | -0.03 | -0.026 |
| 2.07599999999997 | -0.035 | -0.03 | -0.025 |
| 2.07899999999997 | -0.035 | -0.03 | -0.025 |
| 2.081999999999971 | -0.035 | -0.03 | -0.025 |
| 2.084999999999971 | -0.035 | -0.03 | -0.025 |
| 2.087999999999971 | -0.034 | -0.03 | -0.025 |
| 2.090999999999971 | -0.034 | -0.03 | -0.025 |
| 2.093999999999971 | -0.034 | -0.029 | -0.025 |
| 2.096999999999971 | -0.034 | -0.029 | -0.025 |
| 2.099999999999971 | -0.034 | -0.029 | -0.025 |
| 2.102999999999971 | -0.034 | -0.029 | -0.025 |
| 2.105999999999971 | -0.034 | -0.029 | -0.025 |
| 2.108999999999972 | -0.033 | -0.029 | -0.024 |
| 2.111999999999972 | -0.033 | -0.029 | -0.024 |
| 2.114999999999972 | -0.033 | -0.029 | -0.024 |
| 2.117999999999972 | -0.033 | -0.029 | -0.024 |
| 2.120999999999972 | -0.033 | -0.028 | -0.024 |
| 2.123999999999972 | -0.033 | -0.028 | -0.024 |
| 2.126999999999972 | -0.033 | -0.028 | -0.024 |
| 2.129999999999972 | -0.032 | -0.028 | -0.024 |
| 2.132999999999972 | -0.032 | -0.028 | -0.024 |
| 2.135999999999973 | -0.032 | -0.028 | -0.024 |
| 2.138999999999973 | -0.032 | -0.028 | -0.024 |
| 2.141999999999973 | -0.032 | -0.028 | -0.024 |
| 2.144999999999973 | -0.032 | -0.028 | -0.023 |
| 2.147999999999973 | -0.032 | -0.028 | -0.023 |
| 2.150999999999973 | -0.032 | -0.027 | -0.023 |
| 2.153999999999973 | -0.031 | -0.027 | -0.023 |
| 2.156999999999973 | -0.031 | -0.027 | -0.023 |
| 2.159999999999973 | -0.031 | -0.027 | -0.023 |
| 2.162999999999974 | -0.031 | -0.027 | -0.023 |
| 2.165999999999974 | -0.031 | -0.027 | -0.023 |
| 2.168999999999974 | -0.031 | -0.027 | -0.023 |
| 2.171999999999974 | -0.031 | -0.027 | -0.023 |
| 2.174999999999974 | -0.031 | -0.027 | -0.023 |
| 2.177999999999974 | -0.03 | -0.027 | -0.023 |
| 2.180999999999974 | -0.03 | -0.026 | -0.023 |
| 2.183999999999974 | -0.03 | -0.026 | -0.022 |
| 2.186999999999974 | -0.03 | -0.026 | -0.022 |
| 2.189999999999975 | -0.03 | -0.026 | -0.022 |
| 2.192999999999975 | -0.03 | -0.026 | -0.022 |
| 2.195999999999975 | -0.03 | -0.026 | -0.022 |
| 2.198999999999975 | -0.03 | -0.026 | -0.022 |
| 2.201999999999975 | -0.029 | -0.026 | -0.022 |
| 2.204999999999975 | -0.029 | -0.026 | -0.022 |
| 2.207999999999975 | -0.029 | -0.026 | -0.022 |
| 2.210999999999975 | -0.029 | -0.025 | -0.022 |
| 2.213999999999976 | -0.029 | -0.025 | -0.022 |
| 2.216999999999976 | -0.029 | -0.025 | -0.022 |
| 2.219999999999976 | -0.029 | -0.025 | -0.022 |
| 2.222999999999976 | -0.029 | -0.025 | -0.021 |
| 2.225999999999976 | -0.029 | -0.025 | -0.021 |
| 2.228999999999976 | -0.028 | -0.025 | -0.021 |
| 2.231999999999976 | -0.028 | -0.025 | -0.021 |
| 2.234999999999976 | -0.028 | -0.025 | -0.021 |
| 2.237999999999976 | -0.028 | -0.025 | -0.021 |
| 2.240999999999976 | -0.028 | -0.025 | -0.021 |
| 2.243999999999976 | -0.028 | -0.024 | -0.021 |
| 2.246999999999977 | -0.028 | -0.024 | -0.021 |
| 2.249999999999977 | -0.028 | -0.024 | -0.021 |
| 2.252999999999977 | -0.028 | -0.024 | -0.021 |
| 2.255999999999977 | -0.027 | -0.024 | -0.021 |
| 2.258999999999977 | -0.027 | -0.024 | -0.021 |
| 2.261999999999977 | -0.027 | -0.024 | -0.021 |
| 2.264999999999977 | -0.027 | -0.024 | -0.02 |
| 2.267999999999977 | -0.027 | -0.024 | -0.02 |
| 2.270999999999978 | -0.027 | -0.024 | -0.02 |
| 2.273999999999978 | -0.027 | -0.024 | -0.02 |
| 2.276999999999978 | -0.027 | -0.024 | -0.02 |
| 2.279999999999978 | -0.027 | -0.023 | -0.02 |
| 2.282999999999978 | -0.027 | -0.023 | -0.02 |
| 2.285999999999978 | -0.026 | -0.023 | -0.02 |
| 2.288999999999978 | -0.026 | -0.023 | -0.02 |
| 2.291999999999978 | -0.026 | -0.023 | -0.02 |
| 2.294999999999979 | -0.026 | -0.023 | -0.02 |
| 2.297999999999979 | -0.026 | -0.023 | -0.02 |
| 2.300999999999979 | -0.026 | -0.023 | -0.02 |
| 2.303999999999979 | -0.026 | -0.023 | -0.02 |
| 2.306999999999979 | -0.026 | -0.023 | -0.02 |
| 2.309999999999979 | -0.026 | -0.023 | -0.019 |
| 2.312999999999979 | -0.026 | -0.023 | -0.019 |
| 2.315999999999979 | -0.025 | -0.022 | -0.019 |
| 2.318999999999979 | -0.025 | -0.022 | -0.019 |
| 2.32199999999998 | -0.025 | -0.022 | -0.019 |
| 2.32499999999998 | -0.025 | -0.022 | -0.019 |
| 2.32799999999998 | -0.025 | -0.022 | -0.019 |
| 2.33099999999998 | -0.025 | -0.022 | -0.019 |
| 2.33399999999998 | -0.025 | -0.022 | -0.019 |
| 2.33699999999998 | -0.025 | -0.022 | -0.019 |
| 2.33999999999998 | -0.025 | -0.022 | -0.019 |
| 2.34299999999998 | -0.025 | -0.022 | -0.019 |
| 2.34599999999998 | -0.025 | -0.022 | -0.019 |
| 2.348999999999981 | -0.024 | -0.022 | -0.019 |
| 2.351999999999981 | -0.024 | -0.022 | -0.019 |
| 2.354999999999981 | -0.024 | -0.021 | -0.019 |
| 2.357999999999981 | -0.024 | -0.021 | -0.018 |
| 2.360999999999981 | -0.024 | -0.021 | -0.018 |
| 2.363999999999981 | -0.024 | -0.021 | -0.018 |
| 2.366999999999981 | -0.024 | -0.021 | -0.018 |
| 2.369999999999981 | -0.024 | -0.021 | -0.018 |
| 2.372999999999982 | -0.024 | -0.021 | -0.018 |
| 2.375999999999982 | -0.024 | -0.021 | -0.018 |
| 2.378999999999982 | -0.024 | -0.021 | -0.018 |
| 2.381999999999982 | -0.023 | -0.021 | -0.018 |
| 2.384999999999982 | -0.023 | -0.021 | -0.018 |
| 2.387999999999982 | -0.023 | -0.021 | -0.018 |
| 2.390999999999982 | -0.023 | -0.021 | -0.018 |
| 2.393999999999982 | -0.023 | -0.021 | -0.018 |
| 2.396999999999982 | -0.023 | -0.02 | -0.018 |
| 2.399999999999983 | -0.023 | -0.02 | -0.018 |
| 2.402999999999983 | -0.023 | -0.02 | -0.018 |
| 2.405999999999983 | -0.023 | -0.02 | -0.018 |
| 2.408999999999983 | -0.023 | -0.02 | -0.017 |
| 2.411999999999983 | -0.023 | -0.02 | -0.017 |
| 2.414999999999983 | -0.023 | -0.02 | -0.017 |
| 2.417999999999983 | -0.022 | -0.02 | -0.017 |
| 2.420999999999983 | -0.022 | -0.02 | -0.017 |
| 2.423999999999983 | -0.022 | -0.02 | -0.017 |
| 2.426999999999984 | -0.022 | -0.02 | -0.017 |
| 2.429999999999984 | -0.022 | -0.02 | -0.017 |
| 2.432999999999984 | -0.022 | -0.02 | -0.017 |
| 2.435999999999984 | -0.022 | -0.02 | -0.017 |
| 2.438999999999984 | -0.022 | -0.02 | -0.017 |
| 2.441999999999984 | -0.022 | -0.019 | -0.017 |
| 2.444999999999984 | -0.022 | -0.019 | -0.017 |
| 2.447999999999984 | -0.022 | -0.019 | -0.017 |
| 2.450999999999984 | -0.022 | -0.019 | -0.017 |
| 2.453999999999985 | -0.022 | -0.019 | -0.017 |
| 2.456999999999985 | -0.021 | -0.019 | -0.017 |
| 2.459999999999985 | -0.021 | -0.019 | -0.017 |
| 2.462999999999985 | -0.021 | -0.019 | -0.017 |
| 2.465999999999985 | -0.021 | -0.019 | -0.016 |
| 2.468999999999985 | -0.021 | -0.019 | -0.016 |
| 2.471999999999985 | -0.021 | -0.019 | -0.016 |
| 2.474999999999985 | -0.021 | -0.019 | -0.016 |
| 2.477999999999986 | -0.021 | -0.019 | -0.016 |
| 2.480999999999986 | -0.021 | -0.019 | -0.016 |
| 2.483999999999986 | -0.021 | -0.019 | -0.016 |
| 2.486999999999986 | -0.021 | -0.019 | -0.016 |
| 2.489999999999986 | -0.021 | -0.018 | -0.016 |
| 2.492999999999986 | -0.021 | -0.018 | -0.016 |
| 2.495999999999986 | -0.02 | -0.018 | -0.016 |
| 2.498999999999986 | -0.02 | -0.018 | -0.016 |
| 2.501999999999986 | -0.02 | -0.018 | -0.016 |
| 2.504999999999987 | -0.02 | -0.018 | -0.016 |
| 2.507999999999987 | -0.02 | -0.018 | -0.016 |
| 2.510999999999987 | -0.02 | -0.018 | -0.016 |
| 2.513999999999987 | -0.02 | -0.018 | -0.016 |
| 2.516999999999987 | -0.02 | -0.018 | -0.016 |
| 2.519999999999987 | -0.02 | -0.018 | -0.016 |
| 2.522999999999987 | -0.02 | -0.018 | -0.016 |
| 2.525999999999987 | -0.02 | -0.018 | -0.015 |
| 2.528999999999987 | -0.02 | -0.018 | -0.015 |
| 2.531999999999988 | -0.02 | -0.018 | -0.015 |
| 2.534999999999988 | -0.02 | -0.018 | -0.015 |
| 2.537999999999988 | -0.02 | -0.018 | -0.015 |
| 2.540999999999988 | -0.019 | -0.017 | -0.015 |
| 2.543999999999988 | -0.019 | -0.017 | -0.015 |
| 2.546999999999988 | -0.019 | -0.017 | -0.015 |
| 2.549999999999988 | -0.019 | -0.017 | -0.015 |
| 2.552999999999988 | -0.019 | -0.017 | -0.015 |
| 2.555999999999988 | -0.019 | -0.017 | -0.015 |
| 2.558999999999989 | -0.019 | -0.017 | -0.015 |
| 2.561999999999989 | -0.019 | -0.017 | -0.015 |
| 2.564999999999989 | -0.019 | -0.017 | -0.015 |
| 2.567999999999989 | -0.019 | -0.017 | -0.015 |
| 2.570999999999989 | -0.019 | -0.017 | -0.015 |
| 2.573999999999989 | -0.019 | -0.017 | -0.015 |
| 2.576999999999989 | -0.019 | -0.017 | -0.015 |
| 2.579999999999989 | -0.019 | -0.017 | -0.015 |
| 2.58299999999999 | -0.019 | -0.017 | -0.015 |
| 2.58599999999999 | -0.018 | -0.017 | -0.015 |
| 2.58899999999999 | -0.018 | -0.017 | -0.015 |
| 2.59199999999999 | -0.018 | -0.017 | -0.014 |
| 2.59499999999999 | -0.018 | -0.016 | -0.014 |
| 2.59799999999999 | -0.018 | -0.016 | -0.014 |
| 2.60099999999999 | -0.018 | -0.016 | -0.014 |
| 2.60399999999999 | -0.018 | -0.016 | -0.014 |
| 2.60699999999999 | -0.018 | -0.016 | -0.014 |
| 2.60999999999999 | -0.018 | -0.016 | -0.014 |
| 2.612999999999991 | -0.018 | -0.016 | -0.014 |
| 2.615999999999991 | -0.018 | -0.016 | -0.014 |
| 2.618999999999991 | -0.018 | -0.016 | -0.014 |
| 2.621999999999991 | -0.018 | -0.016 | -0.014 |
| 2.624999999999991 | -0.018 | -0.016 | -0.014 |
| 2.627999999999991 | -0.018 | -0.016 | -0.014 |
| 2.630999999999991 | -0.018 | -0.016 | -0.014 |
| 2.633999999999991 | -0.018 | -0.016 | -0.014 |
| 2.636999999999991 | -0.017 | -0.016 | -0.014 |
| 2.639999999999992 | -0.017 | -0.016 | -0.014 |
| 2.642999999999992 | -0.017 | -0.016 | -0.014 |
| 2.645999999999992 | -0.017 | -0.016 | -0.014 |
| 2.648999999999992 | -0.017 | -0.016 | -0.014 |
| 2.651999999999992 | -0.017 | -0.016 | -0.014 |
| 2.654999999999992 | -0.017 | -0.015 | -0.014 |
| 2.657999999999992 | -0.017 | -0.015 | -0.014 |
| 2.660999999999992 | -0.017 | -0.015 | -0.014 |
| 2.663999999999992 | -0.017 | -0.015 | -0.013 |
| 2.666999999999993 | -0.017 | -0.015 | -0.013 |
| 2.669999999999993 | -0.017 | -0.015 | -0.013 |
| 2.672999999999993 | -0.017 | -0.015 | -0.013 |
| 2.675999999999993 | -0.017 | -0.015 | -0.013 |
| 2.678999999999993 | -0.017 | -0.015 | -0.013 |
| 2.681999999999993 | -0.017 | -0.015 | -0.013 |
| 2.684999999999993 | -0.017 | -0.015 | -0.013 |
| 2.687999999999993 | -0.016 | -0.015 | -0.013 |
| 2.690999999999994 | -0.016 | -0.015 | -0.013 |
| 2.693999999999994 | -0.016 | -0.015 | -0.013 |
| 2.696999999999994 | -0.016 | -0.015 | -0.013 |
| 2.699999999999994 | -0.016 | -0.015 | -0.013 |
| 2.702999999999994 | -0.016 | -0.015 | -0.013 |
| 2.705999999999994 | -0.016 | -0.015 | -0.013 |
| 2.708999999999994 | -0.016 | -0.015 | -0.013 |
| 2.711999999999994 | -0.016 | -0.015 | -0.013 |
| 2.714999999999994 | -0.016 | -0.015 | -0.013 |
| 2.717999999999995 | -0.016 | -0.014 | -0.013 |
| 2.720999999999995 | -0.016 | -0.014 | -0.013 |
| 2.723999999999995 | -0.016 | -0.014 | -0.013 |
| 2.726999999999995 | -0.016 | -0.014 | -0.013 |
| 2.729999999999995 | -0.016 | -0.014 | -0.013 |
| 2.732999999999995 | -0.016 | -0.014 | -0.013 |
| 2.735999999999995 | -0.016 | -0.014 | -0.013 |
| 2.738999999999995 | -0.016 | -0.014 | -0.013 |
| 2.741999999999995 | -0.016 | -0.014 | -0.013 |
| 2.744999999999996 | -0.016 | -0.014 | -0.012 |
| 2.747999999999996 | -0.015 | -0.014 | -0.012 |
| 2.750999999999996 | -0.015 | -0.014 | -0.012 |
| 2.753999999999996 | -0.015 | -0.014 | -0.012 |
| 2.756999999999996 | -0.015 | -0.014 | -0.012 |
| 2.759999999999996 | -0.015 | -0.014 | -0.012 |
| 2.762999999999996 | -0.015 | -0.014 | -0.012 |
| 2.765999999999996 | -0.015 | -0.014 | -0.012 |
| 2.768999999999996 | -0.015 | -0.014 | -0.012 |
| 2.771999999999997 | -0.015 | -0.014 | -0.012 |
| 2.774999999999997 | -0.015 | -0.014 | -0.012 |
| 2.777999999999997 | -0.015 | -0.014 | -0.012 |
| 2.780999999999997 | -0.015 | -0.014 | -0.012 |
| 2.783999999999997 | -0.015 | -0.014 | -0.012 |
| 2.786999999999997 | -0.015 | -0.014 | -0.012 |
| 2.789999999999997 | -0.015 | -0.013 | -0.012 |
| 2.792999999999997 | -0.015 | -0.013 | -0.012 |
| 2.795999999999998 | -0.015 | -0.013 | -0.012 |
| 2.798999999999998 | -0.015 | -0.013 | -0.012 |
| 2.801999999999998 | -0.015 | -0.013 | -0.012 |
| 2.804999999999998 | -0.015 | -0.013 | -0.012 |
| 2.807999999999998 | -0.015 | -0.013 | -0.012 |
| 2.810999999999998 | -0.014 | -0.013 | -0.012 |
| 2.813999999999998 | -0.014 | -0.013 | -0.012 |
| 2.816999999999998 | -0.014 | -0.013 | -0.012 |
| 2.819999999999998 | -0.014 | -0.013 | -0.012 |
| 2.822999999999999 | -0.014 | -0.013 | -0.012 |
| 2.825999999999999 | -0.014 | -0.013 | -0.012 |
| 2.828999999999999 | -0.014 | -0.013 | -0.012 |
| 2.831999999999999 | -0.014 | -0.013 | -0.011 |
| 2.834999999999999 | -0.014 | -0.013 | -0.011 |
| 2.837999999999999 | -0.014 | -0.013 | -0.011 |
| 2.840999999999999 | -0.014 | -0.013 | -0.011 |
| 2.843999999999999 | -0.014 | -0.013 | -0.011 |
| 2.846999999999999 | -0.014 | -0.013 | -0.011 |
| 2.85 | -0.014 | -0.013 | -0.011 |
| 2.853 | -0.014 | -0.013 | -0.011 |
| 2.856 | -0.014 | -0.013 | -0.011 |
| 2.859 | -0.014 | -0.013 | -0.011 |
| 2.862 | -0.014 | -0.013 | -0.011 |
| 2.865 | -0.014 | -0.013 | -0.011 |
| 2.868 | -0.014 | -0.012 | -0.011 |
| 2.871 | -0.014 | -0.012 | -0.011 |
| 2.874000000000001 | -0.014 | -0.012 | -0.011 |
| 2.877000000000001 | -0.014 | -0.012 | -0.011 |
| 2.880000000000001 | -0.013 | -0.012 | -0.011 |
| 2.883000000000001 | -0.013 | -0.012 | -0.011 |
| 2.886000000000001 | -0.013 | -0.012 | -0.011 |
| 2.889000000000001 | -0.013 | -0.012 | -0.011 |
| 2.892000000000001 | -0.013 | -0.012 | -0.011 |
| 2.895000000000001 | -0.013 | -0.012 | -0.011 |
| 2.898000000000001 | -0.013 | -0.012 | -0.011 |
| 2.901000000000002 | -0.013 | -0.012 | -0.011 |
| 2.904000000000002 | -0.013 | -0.012 | -0.011 |
| 2.907000000000002 | -0.013 | -0.012 | -0.011 |
| 2.910000000000002 | -0.013 | -0.012 | -0.011 |
| 2.913000000000002 | -0.013 | -0.012 | -0.011 |
| 2.916000000000002 | -0.013 | -0.012 | -0.011 |
| 2.919000000000002 | -0.013 | -0.012 | -0.011 |
| 2.922000000000002 | -0.013 | -0.012 | -0.011 |
| 2.925000000000002 | -0.013 | -0.012 | -0.011 |
| 2.928000000000003 | -0.013 | -0.012 | -0.011 |
| 2.931000000000003 | -0.013 | -0.012 | -0.01 |
| 2.934000000000003 | -0.013 | -0.012 | -0.01 |
| 2.937000000000003 | -0.013 | -0.012 | -0.01 |
| 2.940000000000003 | -0.013 | -0.012 | -0.01 |
| 2.943000000000003 | -0.013 | -0.012 | -0.01 |
| 2.946000000000003 | -0.013 | -0.012 | -0.01 |
| 2.949000000000003 | -0.013 | -0.012 | -0.01 |
| 2.952000000000003 | -0.013 | -0.012 | -0.01 |
| 2.955000000000004 | -0.012 | -0.011 | -0.01 |
| 2.958000000000004 | -0.012 | -0.011 | -0.01 |
| 2.961000000000004 | -0.012 | -0.011 | -0.01 |
| 2.964000000000004 | -0.012 | -0.011 | -0.01 |
| 2.967000000000004 | -0.012 | -0.011 | -0.01 |
| 2.970000000000004 | -0.012 | -0.011 | -0.01 |
| 2.973000000000004 | -0.012 | -0.011 | -0.01 |
| 2.976000000000004 | -0.012 | -0.011 | -0.01 |
| 2.979000000000005 | -0.012 | -0.011 | -0.01 |
| 2.982000000000005 | -0.012 | -0.011 | -0.01 |
| 2.985000000000005 | -0.012 | -0.011 | -0.01 |
| 2.988000000000005 | -0.012 | -0.011 | -0.01 |
| 2.991000000000005 | -0.012 | -0.011 | -0.01 |
| 2.994000000000005 | -0.012 | -0.011 | -0.01 |
| 2.997000000000005 | -0.012 | -0.011 | -0.01 |
| 3.000000000000005 | -0.012 | -0.011 | -0.01 |